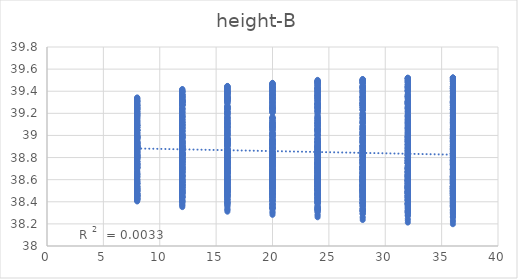
| Category | out:UTCI |
|---|---|
| 8.0 | 38.668 |
| 8.0 | 38.741 |
| 8.0 | 38.758 |
| 8.0 | 38.744 |
| 8.0 | 38.714 |
| 8.0 | 38.517 |
| 8.0 | 38.595 |
| 8.0 | 38.642 |
| 8.0 | 38.679 |
| 8.0 | 38.672 |
| 8.0 | 38.457 |
| 8.0 | 38.521 |
| 8.0 | 38.559 |
| 8.0 | 38.588 |
| 8.0 | 38.606 |
| 8.0 | 38.426 |
| 8.0 | 38.489 |
| 8.0 | 38.495 |
| 8.0 | 38.526 |
| 8.0 | 38.543 |
| 8.0 | 38.423 |
| 8.0 | 38.454 |
| 8.0 | 38.47 |
| 8.0 | 38.474 |
| 8.0 | 38.492 |
| 8.0 | 38.417 |
| 8.0 | 38.42 |
| 8.0 | 38.46 |
| 8.0 | 38.458 |
| 8.0 | 38.452 |
| 8.0 | 38.414 |
| 8.0 | 38.429 |
| 8.0 | 38.432 |
| 8.0 | 38.448 |
| 8.0 | 38.426 |
| 8.0 | 38.403 |
| 8.0 | 38.423 |
| 8.0 | 38.41 |
| 8.0 | 38.426 |
| 8.0 | 38.414 |
| 12.0 | 38.693 |
| 12.0 | 38.779 |
| 12.0 | 38.826 |
| 12.0 | 38.826 |
| 12.0 | 38.8 |
| 12.0 | 38.522 |
| 12.0 | 38.629 |
| 12.0 | 38.708 |
| 12.0 | 38.76 |
| 12.0 | 38.75 |
| 12.0 | 38.432 |
| 12.0 | 38.535 |
| 12.0 | 38.614 |
| 12.0 | 38.657 |
| 12.0 | 38.685 |
| 12.0 | 38.386 |
| 12.0 | 38.482 |
| 12.0 | 38.531 |
| 12.0 | 38.588 |
| 12.0 | 38.615 |
| 12.0 | 38.378 |
| 12.0 | 38.439 |
| 12.0 | 38.492 |
| 12.0 | 38.522 |
| 12.0 | 38.553 |
| 12.0 | 38.37 |
| 12.0 | 38.397 |
| 12.0 | 38.476 |
| 12.0 | 38.494 |
| 12.0 | 38.504 |
| 12.0 | 38.364 |
| 12.0 | 38.402 |
| 12.0 | 38.442 |
| 12.0 | 38.48 |
| 12.0 | 38.47 |
| 12.0 | 38.352 |
| 12.0 | 38.397 |
| 12.0 | 38.416 |
| 12.0 | 38.455 |
| 12.0 | 38.456 |
| 16.0 | 38.703 |
| 16.0 | 38.82 |
| 16.0 | 38.854 |
| 16.0 | 38.875 |
| 16.0 | 38.856 |
| 16.0 | 38.522 |
| 16.0 | 38.662 |
| 16.0 | 38.729 |
| 16.0 | 38.799 |
| 16.0 | 38.802 |
| 16.0 | 38.418 |
| 16.0 | 38.557 |
| 16.0 | 38.63 |
| 16.0 | 38.697 |
| 16.0 | 38.734 |
| 16.0 | 38.355 |
| 16.0 | 38.493 |
| 16.0 | 38.54 |
| 16.0 | 38.623 |
| 16.0 | 38.661 |
| 16.0 | 38.34 |
| 16.0 | 38.436 |
| 16.0 | 38.489 |
| 16.0 | 38.549 |
| 16.0 | 38.593 |
| 16.0 | 38.33 |
| 16.0 | 38.388 |
| 16.0 | 38.463 |
| 16.0 | 38.512 |
| 16.0 | 38.534 |
| 16.0 | 38.324 |
| 16.0 | 38.389 |
| 16.0 | 38.424 |
| 16.0 | 38.49 |
| 16.0 | 38.494 |
| 16.0 | 38.31 |
| 16.0 | 38.383 |
| 16.0 | 38.394 |
| 16.0 | 38.462 |
| 16.0 | 38.472 |
| 20.0 | 38.712 |
| 20.0 | 38.824 |
| 20.0 | 38.878 |
| 20.0 | 38.886 |
| 20.0 | 38.88 |
| 20.0 | 38.524 |
| 20.0 | 38.658 |
| 20.0 | 38.749 |
| 20.0 | 38.808 |
| 20.0 | 38.826 |
| 20.0 | 38.414 |
| 20.0 | 38.547 |
| 20.0 | 38.644 |
| 20.0 | 38.704 |
| 20.0 | 38.756 |
| 20.0 | 38.343 |
| 20.0 | 38.474 |
| 20.0 | 38.547 |
| 20.0 | 38.622 |
| 20.0 | 38.68 |
| 20.0 | 38.319 |
| 20.0 | 38.407 |
| 20.0 | 38.491 |
| 20.0 | 38.544 |
| 20.0 | 38.609 |
| 20.0 | 38.305 |
| 20.0 | 38.348 |
| 20.0 | 38.458 |
| 20.0 | 38.501 |
| 20.0 | 38.547 |
| 20.0 | 38.297 |
| 20.0 | 38.344 |
| 20.0 | 38.413 |
| 20.0 | 38.473 |
| 20.0 | 38.499 |
| 20.0 | 38.282 |
| 20.0 | 38.334 |
| 20.0 | 38.38 |
| 20.0 | 38.439 |
| 20.0 | 38.473 |
| 24.0 | 38.71 |
| 24.0 | 38.832 |
| 24.0 | 38.879 |
| 24.0 | 38.908 |
| 24.0 | 38.891 |
| 24.0 | 38.52 |
| 24.0 | 38.661 |
| 24.0 | 38.745 |
| 24.0 | 38.826 |
| 24.0 | 38.833 |
| 24.0 | 38.406 |
| 24.0 | 38.545 |
| 24.0 | 38.636 |
| 24.0 | 38.719 |
| 24.0 | 38.76 |
| 24.0 | 38.332 |
| 24.0 | 38.468 |
| 24.0 | 38.534 |
| 24.0 | 38.634 |
| 24.0 | 38.681 |
| 24.0 | 38.305 |
| 24.0 | 38.398 |
| 24.0 | 38.477 |
| 24.0 | 38.554 |
| 24.0 | 38.609 |
| 24.0 | 38.285 |
| 24.0 | 38.335 |
| 24.0 | 38.439 |
| 24.0 | 38.509 |
| 24.0 | 38.543 |
| 24.0 | 38.275 |
| 24.0 | 38.327 |
| 24.0 | 38.388 |
| 24.0 | 38.475 |
| 24.0 | 38.493 |
| 24.0 | 38.26 |
| 24.0 | 38.313 |
| 24.0 | 38.346 |
| 24.0 | 38.434 |
| 24.0 | 38.462 |
| 28.0 | 38.703 |
| 28.0 | 38.833 |
| 28.0 | 38.884 |
| 28.0 | 38.91 |
| 28.0 | 38.909 |
| 28.0 | 38.51 |
| 28.0 | 38.661 |
| 28.0 | 38.746 |
| 28.0 | 38.824 |
| 28.0 | 38.847 |
| 28.0 | 38.396 |
| 28.0 | 38.542 |
| 28.0 | 38.633 |
| 28.0 | 38.716 |
| 28.0 | 38.771 |
| 28.0 | 38.319 |
| 28.0 | 38.461 |
| 28.0 | 38.527 |
| 28.0 | 38.627 |
| 28.0 | 38.69 |
| 28.0 | 38.291 |
| 28.0 | 38.389 |
| 28.0 | 38.467 |
| 28.0 | 38.544 |
| 28.0 | 38.616 |
| 28.0 | 38.265 |
| 28.0 | 38.321 |
| 28.0 | 38.423 |
| 28.0 | 38.494 |
| 28.0 | 38.545 |
| 28.0 | 38.252 |
| 28.0 | 38.309 |
| 28.0 | 38.368 |
| 28.0 | 38.459 |
| 28.0 | 38.493 |
| 28.0 | 38.235 |
| 28.0 | 38.291 |
| 28.0 | 38.321 |
| 28.0 | 38.415 |
| 28.0 | 38.457 |
| 32.0 | 38.688 |
| 32.0 | 38.836 |
| 32.0 | 38.885 |
| 32.0 | 38.915 |
| 32.0 | 38.902 |
| 32.0 | 38.494 |
| 32.0 | 38.663 |
| 32.0 | 38.747 |
| 32.0 | 38.825 |
| 32.0 | 38.839 |
| 32.0 | 38.379 |
| 32.0 | 38.543 |
| 32.0 | 38.631 |
| 32.0 | 38.714 |
| 32.0 | 38.76 |
| 32.0 | 38.301 |
| 32.0 | 38.46 |
| 32.0 | 38.522 |
| 32.0 | 38.623 |
| 32.0 | 38.676 |
| 32.0 | 38.273 |
| 32.0 | 38.386 |
| 32.0 | 38.461 |
| 32.0 | 38.537 |
| 32.0 | 38.601 |
| 32.0 | 38.247 |
| 32.0 | 38.316 |
| 32.0 | 38.415 |
| 32.0 | 38.485 |
| 32.0 | 38.528 |
| 32.0 | 38.232 |
| 32.0 | 38.303 |
| 32.0 | 38.358 |
| 32.0 | 38.448 |
| 32.0 | 38.475 |
| 32.0 | 38.212 |
| 32.0 | 38.282 |
| 32.0 | 38.309 |
| 32.0 | 38.402 |
| 32.0 | 38.438 |
| 36.0 | 38.678 |
| 36.0 | 38.832 |
| 36.0 | 38.888 |
| 36.0 | 38.904 |
| 36.0 | 38.906 |
| 36.0 | 38.483 |
| 36.0 | 38.657 |
| 36.0 | 38.748 |
| 36.0 | 38.812 |
| 36.0 | 38.839 |
| 36.0 | 38.368 |
| 36.0 | 38.535 |
| 36.0 | 38.632 |
| 36.0 | 38.699 |
| 36.0 | 38.759 |
| 36.0 | 38.288 |
| 36.0 | 38.452 |
| 36.0 | 38.521 |
| 36.0 | 38.606 |
| 36.0 | 38.672 |
| 36.0 | 38.26 |
| 36.0 | 38.375 |
| 36.0 | 38.456 |
| 36.0 | 38.518 |
| 36.0 | 38.596 |
| 36.0 | 38.234 |
| 36.0 | 38.302 |
| 36.0 | 38.407 |
| 36.0 | 38.46 |
| 36.0 | 38.518 |
| 36.0 | 38.218 |
| 36.0 | 38.288 |
| 36.0 | 38.349 |
| 36.0 | 38.422 |
| 36.0 | 38.464 |
| 36.0 | 38.197 |
| 36.0 | 38.267 |
| 36.0 | 38.3 |
| 36.0 | 38.375 |
| 36.0 | 38.426 |
| 8.0 | 38.717 |
| 8.0 | 38.761 |
| 8.0 | 38.802 |
| 8.0 | 38.76 |
| 8.0 | 38.723 |
| 8.0 | 38.567 |
| 8.0 | 38.643 |
| 8.0 | 38.711 |
| 8.0 | 38.699 |
| 8.0 | 38.701 |
| 8.0 | 38.508 |
| 8.0 | 38.539 |
| 8.0 | 38.602 |
| 8.0 | 38.629 |
| 8.0 | 38.636 |
| 8.0 | 38.472 |
| 8.0 | 38.507 |
| 8.0 | 38.535 |
| 8.0 | 38.542 |
| 8.0 | 38.569 |
| 8.0 | 38.459 |
| 8.0 | 38.454 |
| 8.0 | 38.507 |
| 8.0 | 38.491 |
| 8.0 | 38.509 |
| 8.0 | 38.466 |
| 8.0 | 38.451 |
| 8.0 | 38.5 |
| 8.0 | 38.473 |
| 8.0 | 38.465 |
| 8.0 | 38.441 |
| 8.0 | 38.454 |
| 8.0 | 38.455 |
| 8.0 | 38.449 |
| 8.0 | 38.442 |
| 8.0 | 38.436 |
| 8.0 | 38.425 |
| 8.0 | 38.438 |
| 8.0 | 38.433 |
| 8.0 | 38.428 |
| 12.0 | 38.762 |
| 12.0 | 38.84 |
| 12.0 | 38.893 |
| 12.0 | 38.85 |
| 12.0 | 38.832 |
| 12.0 | 38.593 |
| 12.0 | 38.72 |
| 12.0 | 38.795 |
| 12.0 | 38.794 |
| 12.0 | 38.81 |
| 12.0 | 38.508 |
| 12.0 | 38.601 |
| 12.0 | 38.677 |
| 12.0 | 38.714 |
| 12.0 | 38.737 |
| 12.0 | 38.453 |
| 12.0 | 38.546 |
| 12.0 | 38.594 |
| 12.0 | 38.622 |
| 12.0 | 38.669 |
| 12.0 | 38.435 |
| 12.0 | 38.482 |
| 12.0 | 38.551 |
| 12.0 | 38.557 |
| 12.0 | 38.6 |
| 12.0 | 38.441 |
| 12.0 | 38.47 |
| 12.0 | 38.537 |
| 12.0 | 38.527 |
| 12.0 | 38.546 |
| 12.0 | 38.41 |
| 12.0 | 38.471 |
| 12.0 | 38.486 |
| 12.0 | 38.498 |
| 12.0 | 38.513 |
| 12.0 | 38.402 |
| 12.0 | 38.442 |
| 12.0 | 38.466 |
| 12.0 | 38.478 |
| 12.0 | 38.496 |
| 16.0 | 38.778 |
| 16.0 | 38.869 |
| 16.0 | 38.908 |
| 16.0 | 38.92 |
| 16.0 | 38.88 |
| 16.0 | 38.597 |
| 16.0 | 38.741 |
| 16.0 | 38.808 |
| 16.0 | 38.862 |
| 16.0 | 38.849 |
| 16.0 | 38.496 |
| 16.0 | 38.61 |
| 16.0 | 38.69 |
| 16.0 | 38.768 |
| 16.0 | 38.776 |
| 16.0 | 38.426 |
| 16.0 | 38.546 |
| 16.0 | 38.6 |
| 16.0 | 38.673 |
| 16.0 | 38.704 |
| 16.0 | 38.398 |
| 16.0 | 38.47 |
| 16.0 | 38.546 |
| 16.0 | 38.602 |
| 16.0 | 38.631 |
| 16.0 | 38.4 |
| 16.0 | 38.452 |
| 16.0 | 38.522 |
| 16.0 | 38.562 |
| 16.0 | 38.57 |
| 16.0 | 38.372 |
| 16.0 | 38.448 |
| 16.0 | 38.465 |
| 16.0 | 38.525 |
| 16.0 | 38.531 |
| 16.0 | 38.362 |
| 16.0 | 38.418 |
| 16.0 | 38.441 |
| 16.0 | 38.503 |
| 16.0 | 38.508 |
| 20.0 | 38.774 |
| 20.0 | 38.881 |
| 20.0 | 38.947 |
| 20.0 | 38.917 |
| 20.0 | 38.921 |
| 20.0 | 38.585 |
| 20.0 | 38.745 |
| 20.0 | 38.841 |
| 20.0 | 38.854 |
| 20.0 | 38.891 |
| 20.0 | 38.477 |
| 20.0 | 38.608 |
| 20.0 | 38.717 |
| 20.0 | 38.763 |
| 20.0 | 38.815 |
| 20.0 | 38.412 |
| 20.0 | 38.543 |
| 20.0 | 38.62 |
| 20.0 | 38.667 |
| 20.0 | 38.741 |
| 20.0 | 38.375 |
| 20.0 | 38.46 |
| 20.0 | 38.563 |
| 20.0 | 38.592 |
| 20.0 | 38.666 |
| 20.0 | 38.373 |
| 20.0 | 38.433 |
| 20.0 | 38.532 |
| 20.0 | 38.548 |
| 20.0 | 38.602 |
| 20.0 | 38.348 |
| 20.0 | 38.425 |
| 20.0 | 38.469 |
| 20.0 | 38.504 |
| 20.0 | 38.556 |
| 20.0 | 38.335 |
| 20.0 | 38.391 |
| 20.0 | 38.44 |
| 20.0 | 38.478 |
| 20.0 | 38.529 |
| 24.0 | 38.764 |
| 24.0 | 38.86 |
| 24.0 | 38.954 |
| 24.0 | 38.945 |
| 24.0 | 38.925 |
| 24.0 | 38.572 |
| 24.0 | 38.722 |
| 24.0 | 38.844 |
| 24.0 | 38.878 |
| 24.0 | 38.892 |
| 24.0 | 38.461 |
| 24.0 | 38.579 |
| 24.0 | 38.716 |
| 24.0 | 38.783 |
| 24.0 | 38.812 |
| 24.0 | 38.393 |
| 24.0 | 38.509 |
| 24.0 | 38.615 |
| 24.0 | 38.684 |
| 24.0 | 38.737 |
| 24.0 | 38.358 |
| 24.0 | 38.433 |
| 24.0 | 38.555 |
| 24.0 | 38.607 |
| 24.0 | 38.661 |
| 24.0 | 38.349 |
| 24.0 | 38.4 |
| 24.0 | 38.519 |
| 24.0 | 38.561 |
| 24.0 | 38.595 |
| 24.0 | 38.324 |
| 24.0 | 38.389 |
| 24.0 | 38.453 |
| 24.0 | 38.514 |
| 24.0 | 38.546 |
| 24.0 | 38.31 |
| 24.0 | 38.352 |
| 24.0 | 38.416 |
| 24.0 | 38.48 |
| 24.0 | 38.515 |
| 28.0 | 38.776 |
| 28.0 | 38.889 |
| 28.0 | 38.964 |
| 28.0 | 38.959 |
| 28.0 | 38.943 |
| 28.0 | 38.584 |
| 28.0 | 38.746 |
| 28.0 | 38.852 |
| 28.0 | 38.889 |
| 28.0 | 38.906 |
| 28.0 | 38.47 |
| 28.0 | 38.601 |
| 28.0 | 38.719 |
| 28.0 | 38.792 |
| 28.0 | 38.823 |
| 28.0 | 38.4 |
| 28.0 | 38.526 |
| 28.0 | 38.614 |
| 28.0 | 38.69 |
| 28.0 | 38.746 |
| 28.0 | 38.362 |
| 28.0 | 38.445 |
| 28.0 | 38.552 |
| 28.0 | 38.61 |
| 28.0 | 38.668 |
| 28.0 | 38.339 |
| 28.0 | 38.392 |
| 28.0 | 38.506 |
| 28.0 | 38.559 |
| 28.0 | 38.593 |
| 28.0 | 38.31 |
| 28.0 | 38.378 |
| 28.0 | 38.435 |
| 28.0 | 38.51 |
| 28.0 | 38.543 |
| 28.0 | 38.294 |
| 28.0 | 38.339 |
| 28.0 | 38.394 |
| 28.0 | 38.473 |
| 28.0 | 38.507 |
| 32.0 | 38.763 |
| 32.0 | 38.894 |
| 32.0 | 38.944 |
| 32.0 | 38.952 |
| 32.0 | 38.955 |
| 32.0 | 38.566 |
| 32.0 | 38.75 |
| 32.0 | 38.829 |
| 32.0 | 38.879 |
| 32.0 | 38.918 |
| 32.0 | 38.451 |
| 32.0 | 38.603 |
| 32.0 | 38.695 |
| 32.0 | 38.778 |
| 32.0 | 38.832 |
| 32.0 | 38.379 |
| 32.0 | 38.526 |
| 32.0 | 38.588 |
| 32.0 | 38.674 |
| 32.0 | 38.752 |
| 32.0 | 38.339 |
| 32.0 | 38.442 |
| 32.0 | 38.525 |
| 32.0 | 38.591 |
| 32.0 | 38.672 |
| 32.0 | 38.314 |
| 32.0 | 38.388 |
| 32.0 | 38.476 |
| 32.0 | 38.538 |
| 32.0 | 38.596 |
| 32.0 | 38.292 |
| 32.0 | 38.373 |
| 32.0 | 38.415 |
| 32.0 | 38.491 |
| 32.0 | 38.548 |
| 32.0 | 38.274 |
| 32.0 | 38.334 |
| 32.0 | 38.371 |
| 32.0 | 38.454 |
| 32.0 | 38.51 |
| 36.0 | 38.741 |
| 36.0 | 38.87 |
| 36.0 | 38.954 |
| 36.0 | 38.95 |
| 36.0 | 38.959 |
| 36.0 | 38.541 |
| 36.0 | 38.726 |
| 36.0 | 38.839 |
| 36.0 | 38.874 |
| 36.0 | 38.92 |
| 36.0 | 38.429 |
| 36.0 | 38.579 |
| 36.0 | 38.703 |
| 36.0 | 38.773 |
| 36.0 | 38.834 |
| 36.0 | 38.358 |
| 36.0 | 38.501 |
| 36.0 | 38.595 |
| 36.0 | 38.667 |
| 36.0 | 38.751 |
| 36.0 | 38.318 |
| 36.0 | 38.415 |
| 36.0 | 38.528 |
| 36.0 | 38.583 |
| 36.0 | 38.669 |
| 36.0 | 38.293 |
| 36.0 | 38.359 |
| 36.0 | 38.477 |
| 36.0 | 38.525 |
| 36.0 | 38.588 |
| 36.0 | 38.269 |
| 36.0 | 38.344 |
| 36.0 | 38.413 |
| 36.0 | 38.476 |
| 36.0 | 38.539 |
| 36.0 | 38.259 |
| 36.0 | 38.316 |
| 36.0 | 38.368 |
| 36.0 | 38.435 |
| 36.0 | 38.496 |
| 8.0 | 38.79 |
| 8.0 | 38.817 |
| 8.0 | 38.802 |
| 8.0 | 38.809 |
| 8.0 | 38.819 |
| 8.0 | 38.619 |
| 8.0 | 38.723 |
| 8.0 | 38.74 |
| 8.0 | 38.769 |
| 8.0 | 38.764 |
| 8.0 | 38.538 |
| 8.0 | 38.586 |
| 8.0 | 38.651 |
| 8.0 | 38.706 |
| 8.0 | 38.716 |
| 8.0 | 38.503 |
| 8.0 | 38.541 |
| 8.0 | 38.563 |
| 8.0 | 38.624 |
| 8.0 | 38.652 |
| 8.0 | 38.477 |
| 8.0 | 38.501 |
| 8.0 | 38.516 |
| 8.0 | 38.562 |
| 8.0 | 38.586 |
| 8.0 | 38.472 |
| 8.0 | 38.47 |
| 8.0 | 38.49 |
| 8.0 | 38.512 |
| 8.0 | 38.535 |
| 8.0 | 38.455 |
| 8.0 | 38.465 |
| 8.0 | 38.457 |
| 8.0 | 38.503 |
| 8.0 | 38.493 |
| 8.0 | 38.445 |
| 8.0 | 38.453 |
| 8.0 | 38.441 |
| 8.0 | 38.476 |
| 8.0 | 38.472 |
| 12.0 | 38.822 |
| 12.0 | 38.918 |
| 12.0 | 38.896 |
| 12.0 | 38.908 |
| 12.0 | 38.923 |
| 12.0 | 38.633 |
| 12.0 | 38.801 |
| 12.0 | 38.832 |
| 12.0 | 38.855 |
| 12.0 | 38.874 |
| 12.0 | 38.533 |
| 12.0 | 38.666 |
| 12.0 | 38.731 |
| 12.0 | 38.786 |
| 12.0 | 38.823 |
| 12.0 | 38.48 |
| 12.0 | 38.605 |
| 12.0 | 38.638 |
| 12.0 | 38.704 |
| 12.0 | 38.756 |
| 12.0 | 38.446 |
| 12.0 | 38.551 |
| 12.0 | 38.578 |
| 12.0 | 38.632 |
| 12.0 | 38.681 |
| 12.0 | 38.44 |
| 12.0 | 38.514 |
| 12.0 | 38.543 |
| 12.0 | 38.574 |
| 12.0 | 38.625 |
| 12.0 | 38.42 |
| 12.0 | 38.507 |
| 12.0 | 38.507 |
| 12.0 | 38.557 |
| 12.0 | 38.577 |
| 12.0 | 38.411 |
| 12.0 | 38.493 |
| 12.0 | 38.486 |
| 12.0 | 38.527 |
| 12.0 | 38.549 |
| 16.0 | 38.832 |
| 16.0 | 38.925 |
| 16.0 | 38.944 |
| 16.0 | 38.969 |
| 16.0 | 38.98 |
| 16.0 | 38.632 |
| 16.0 | 38.813 |
| 16.0 | 38.868 |
| 16.0 | 38.91 |
| 16.0 | 38.928 |
| 16.0 | 38.52 |
| 16.0 | 38.667 |
| 16.0 | 38.765 |
| 16.0 | 38.841 |
| 16.0 | 38.865 |
| 16.0 | 38.457 |
| 16.0 | 38.599 |
| 16.0 | 38.667 |
| 16.0 | 38.756 |
| 16.0 | 38.796 |
| 16.0 | 38.418 |
| 16.0 | 38.535 |
| 16.0 | 38.6 |
| 16.0 | 38.68 |
| 16.0 | 38.722 |
| 16.0 | 38.405 |
| 16.0 | 38.488 |
| 16.0 | 38.555 |
| 16.0 | 38.614 |
| 16.0 | 38.662 |
| 16.0 | 38.384 |
| 16.0 | 38.477 |
| 16.0 | 38.514 |
| 16.0 | 38.591 |
| 16.0 | 38.607 |
| 16.0 | 38.374 |
| 16.0 | 38.461 |
| 16.0 | 38.489 |
| 16.0 | 38.555 |
| 16.0 | 38.574 |
| 20.0 | 38.833 |
| 20.0 | 38.943 |
| 20.0 | 38.957 |
| 20.0 | 38.99 |
| 20.0 | 39.021 |
| 20.0 | 38.626 |
| 20.0 | 38.826 |
| 20.0 | 38.88 |
| 20.0 | 38.932 |
| 20.0 | 38.966 |
| 20.0 | 38.509 |
| 20.0 | 38.674 |
| 20.0 | 38.772 |
| 20.0 | 38.86 |
| 20.0 | 38.9 |
| 20.0 | 38.443 |
| 20.0 | 38.593 |
| 20.0 | 38.666 |
| 20.0 | 38.77 |
| 20.0 | 38.829 |
| 20.0 | 38.399 |
| 20.0 | 38.525 |
| 20.0 | 38.596 |
| 20.0 | 38.692 |
| 20.0 | 38.753 |
| 20.0 | 38.381 |
| 20.0 | 38.471 |
| 20.0 | 38.546 |
| 20.0 | 38.623 |
| 20.0 | 38.691 |
| 20.0 | 38.359 |
| 20.0 | 38.455 |
| 20.0 | 38.5 |
| 20.0 | 38.595 |
| 20.0 | 38.634 |
| 20.0 | 38.347 |
| 20.0 | 38.435 |
| 20.0 | 38.466 |
| 20.0 | 38.552 |
| 20.0 | 38.596 |
| 24.0 | 38.83 |
| 24.0 | 38.943 |
| 24.0 | 38.97 |
| 24.0 | 39 |
| 24.0 | 39.032 |
| 24.0 | 38.622 |
| 24.0 | 38.822 |
| 24.0 | 38.889 |
| 24.0 | 38.938 |
| 24.0 | 38.971 |
| 24.0 | 38.5 |
| 24.0 | 38.666 |
| 24.0 | 38.777 |
| 24.0 | 38.864 |
| 24.0 | 38.907 |
| 24.0 | 38.43 |
| 24.0 | 38.581 |
| 24.0 | 38.668 |
| 24.0 | 38.771 |
| 24.0 | 38.834 |
| 24.0 | 38.386 |
| 24.0 | 38.507 |
| 24.0 | 38.596 |
| 24.0 | 38.69 |
| 24.0 | 38.761 |
| 24.0 | 38.364 |
| 24.0 | 38.45 |
| 24.0 | 38.544 |
| 24.0 | 38.619 |
| 24.0 | 38.696 |
| 24.0 | 38.343 |
| 24.0 | 38.43 |
| 24.0 | 38.496 |
| 24.0 | 38.588 |
| 24.0 | 38.637 |
| 24.0 | 38.329 |
| 24.0 | 38.406 |
| 24.0 | 38.457 |
| 24.0 | 38.541 |
| 24.0 | 38.595 |
| 28.0 | 38.839 |
| 28.0 | 38.94 |
| 28.0 | 38.98 |
| 28.0 | 39.012 |
| 28.0 | 39.033 |
| 28.0 | 38.628 |
| 28.0 | 38.815 |
| 28.0 | 38.899 |
| 28.0 | 38.947 |
| 28.0 | 38.974 |
| 28.0 | 38.505 |
| 28.0 | 38.654 |
| 28.0 | 38.782 |
| 28.0 | 38.869 |
| 28.0 | 38.907 |
| 28.0 | 38.435 |
| 28.0 | 38.566 |
| 28.0 | 38.668 |
| 28.0 | 38.774 |
| 28.0 | 38.832 |
| 28.0 | 38.389 |
| 28.0 | 38.49 |
| 28.0 | 38.594 |
| 28.0 | 38.691 |
| 28.0 | 38.757 |
| 28.0 | 38.361 |
| 28.0 | 38.434 |
| 28.0 | 38.543 |
| 28.0 | 38.615 |
| 28.0 | 38.687 |
| 28.0 | 38.336 |
| 28.0 | 38.413 |
| 28.0 | 38.494 |
| 28.0 | 38.582 |
| 28.0 | 38.626 |
| 28.0 | 38.322 |
| 28.0 | 38.386 |
| 28.0 | 38.452 |
| 28.0 | 38.533 |
| 28.0 | 38.583 |
| 32.0 | 38.833 |
| 32.0 | 38.948 |
| 32.0 | 38.979 |
| 32.0 | 39.032 |
| 32.0 | 39.057 |
| 32.0 | 38.621 |
| 32.0 | 38.822 |
| 32.0 | 38.895 |
| 32.0 | 38.966 |
| 32.0 | 38.994 |
| 32.0 | 38.496 |
| 32.0 | 38.66 |
| 32.0 | 38.777 |
| 32.0 | 38.884 |
| 32.0 | 38.926 |
| 32.0 | 38.425 |
| 32.0 | 38.57 |
| 32.0 | 38.662 |
| 32.0 | 38.787 |
| 32.0 | 38.849 |
| 32.0 | 38.379 |
| 32.0 | 38.492 |
| 32.0 | 38.586 |
| 32.0 | 38.701 |
| 32.0 | 38.771 |
| 32.0 | 38.351 |
| 32.0 | 38.434 |
| 32.0 | 38.532 |
| 32.0 | 38.623 |
| 32.0 | 38.7 |
| 32.0 | 38.326 |
| 32.0 | 38.412 |
| 32.0 | 38.482 |
| 32.0 | 38.589 |
| 32.0 | 38.635 |
| 32.0 | 38.311 |
| 32.0 | 38.384 |
| 32.0 | 38.439 |
| 32.0 | 38.54 |
| 32.0 | 38.59 |
| 36.0 | 38.837 |
| 36.0 | 38.948 |
| 36.0 | 38.981 |
| 36.0 | 39.031 |
| 36.0 | 39.053 |
| 36.0 | 38.628 |
| 36.0 | 38.822 |
| 36.0 | 38.897 |
| 36.0 | 38.963 |
| 36.0 | 38.99 |
| 36.0 | 38.499 |
| 36.0 | 38.659 |
| 36.0 | 38.776 |
| 36.0 | 38.88 |
| 36.0 | 38.92 |
| 36.0 | 38.426 |
| 36.0 | 38.566 |
| 36.0 | 38.658 |
| 36.0 | 38.781 |
| 36.0 | 38.843 |
| 36.0 | 38.38 |
| 36.0 | 38.486 |
| 36.0 | 38.578 |
| 36.0 | 38.69 |
| 36.0 | 38.76 |
| 36.0 | 38.351 |
| 36.0 | 38.427 |
| 36.0 | 38.523 |
| 36.0 | 38.61 |
| 36.0 | 38.688 |
| 36.0 | 38.325 |
| 36.0 | 38.404 |
| 36.0 | 38.471 |
| 36.0 | 38.576 |
| 36.0 | 38.622 |
| 36.0 | 38.305 |
| 36.0 | 38.369 |
| 36.0 | 38.417 |
| 36.0 | 38.526 |
| 36.0 | 38.58 |
| 8.0 | 38.891 |
| 8.0 | 38.894 |
| 8.0 | 38.962 |
| 8.0 | 38.928 |
| 8.0 | 38.893 |
| 8.0 | 38.713 |
| 8.0 | 38.833 |
| 8.0 | 38.901 |
| 8.0 | 38.871 |
| 8.0 | 38.873 |
| 8.0 | 38.625 |
| 8.0 | 38.708 |
| 8.0 | 38.813 |
| 8.0 | 38.824 |
| 8.0 | 38.81 |
| 8.0 | 38.565 |
| 8.0 | 38.628 |
| 8.0 | 38.734 |
| 8.0 | 38.752 |
| 8.0 | 38.771 |
| 8.0 | 38.521 |
| 8.0 | 38.578 |
| 8.0 | 38.653 |
| 8.0 | 38.689 |
| 8.0 | 38.724 |
| 8.0 | 38.518 |
| 8.0 | 38.534 |
| 8.0 | 38.615 |
| 8.0 | 38.633 |
| 8.0 | 38.649 |
| 8.0 | 38.51 |
| 8.0 | 38.523 |
| 8.0 | 38.578 |
| 8.0 | 38.575 |
| 8.0 | 38.601 |
| 8.0 | 38.479 |
| 8.0 | 38.5 |
| 8.0 | 38.528 |
| 8.0 | 38.567 |
| 8.0 | 38.561 |
| 12.0 | 38.921 |
| 12.0 | 39.003 |
| 12.0 | 39.055 |
| 12.0 | 39.036 |
| 12.0 | 39.028 |
| 12.0 | 38.734 |
| 12.0 | 38.923 |
| 12.0 | 38.988 |
| 12.0 | 38.979 |
| 12.0 | 38.99 |
| 12.0 | 38.634 |
| 12.0 | 38.791 |
| 12.0 | 38.892 |
| 12.0 | 38.931 |
| 12.0 | 38.925 |
| 12.0 | 38.556 |
| 12.0 | 38.706 |
| 12.0 | 38.81 |
| 12.0 | 38.856 |
| 12.0 | 38.884 |
| 12.0 | 38.507 |
| 12.0 | 38.644 |
| 12.0 | 38.725 |
| 12.0 | 38.788 |
| 12.0 | 38.832 |
| 12.0 | 38.5 |
| 12.0 | 38.593 |
| 12.0 | 38.68 |
| 12.0 | 38.726 |
| 12.0 | 38.757 |
| 12.0 | 38.487 |
| 12.0 | 38.577 |
| 12.0 | 38.635 |
| 12.0 | 38.662 |
| 12.0 | 38.704 |
| 12.0 | 38.453 |
| 12.0 | 38.553 |
| 12.0 | 38.584 |
| 12.0 | 38.647 |
| 12.0 | 38.659 |
| 16.0 | 38.963 |
| 16.0 | 39.019 |
| 16.0 | 39.096 |
| 16.0 | 39.098 |
| 16.0 | 39.072 |
| 16.0 | 38.767 |
| 16.0 | 38.932 |
| 16.0 | 39.019 |
| 16.0 | 39.036 |
| 16.0 | 39.031 |
| 16.0 | 38.655 |
| 16.0 | 38.798 |
| 16.0 | 38.922 |
| 16.0 | 38.989 |
| 16.0 | 38.978 |
| 16.0 | 38.563 |
| 16.0 | 38.708 |
| 16.0 | 38.836 |
| 16.0 | 38.909 |
| 16.0 | 38.934 |
| 16.0 | 38.51 |
| 16.0 | 38.641 |
| 16.0 | 38.748 |
| 16.0 | 38.836 |
| 16.0 | 38.882 |
| 16.0 | 38.499 |
| 16.0 | 38.58 |
| 16.0 | 38.699 |
| 16.0 | 38.775 |
| 16.0 | 38.807 |
| 16.0 | 38.478 |
| 16.0 | 38.561 |
| 16.0 | 38.647 |
| 16.0 | 38.708 |
| 16.0 | 38.752 |
| 16.0 | 38.447 |
| 16.0 | 38.535 |
| 16.0 | 38.593 |
| 16.0 | 38.687 |
| 16.0 | 38.702 |
| 20.0 | 38.962 |
| 20.0 | 39.047 |
| 20.0 | 39.13 |
| 20.0 | 39.127 |
| 20.0 | 39.121 |
| 20.0 | 38.76 |
| 20.0 | 38.959 |
| 20.0 | 39.049 |
| 20.0 | 39.061 |
| 20.0 | 39.077 |
| 20.0 | 38.643 |
| 20.0 | 38.821 |
| 20.0 | 38.947 |
| 20.0 | 39.011 |
| 20.0 | 39.022 |
| 20.0 | 38.542 |
| 20.0 | 38.722 |
| 20.0 | 38.857 |
| 20.0 | 38.92 |
| 20.0 | 38.976 |
| 20.0 | 38.491 |
| 20.0 | 38.653 |
| 20.0 | 38.767 |
| 20.0 | 38.848 |
| 20.0 | 38.92 |
| 20.0 | 38.473 |
| 20.0 | 38.587 |
| 20.0 | 38.716 |
| 20.0 | 38.786 |
| 20.0 | 38.845 |
| 20.0 | 38.448 |
| 20.0 | 38.562 |
| 20.0 | 38.66 |
| 20.0 | 38.717 |
| 20.0 | 38.79 |
| 20.0 | 38.42 |
| 20.0 | 38.533 |
| 20.0 | 38.603 |
| 20.0 | 38.693 |
| 20.0 | 38.736 |
| 24.0 | 38.937 |
| 24.0 | 39.056 |
| 24.0 | 39.126 |
| 24.0 | 39.156 |
| 24.0 | 39.153 |
| 24.0 | 38.733 |
| 24.0 | 38.964 |
| 24.0 | 39.047 |
| 24.0 | 39.086 |
| 24.0 | 39.107 |
| 24.0 | 38.613 |
| 24.0 | 38.822 |
| 24.0 | 38.941 |
| 24.0 | 39.034 |
| 24.0 | 39.05 |
| 24.0 | 38.509 |
| 24.0 | 38.721 |
| 24.0 | 38.848 |
| 24.0 | 38.94 |
| 24.0 | 39.003 |
| 24.0 | 38.465 |
| 24.0 | 38.644 |
| 24.0 | 38.755 |
| 24.0 | 38.867 |
| 24.0 | 38.934 |
| 24.0 | 38.443 |
| 24.0 | 38.573 |
| 24.0 | 38.705 |
| 24.0 | 38.802 |
| 24.0 | 38.858 |
| 24.0 | 38.418 |
| 24.0 | 38.548 |
| 24.0 | 38.645 |
| 24.0 | 38.733 |
| 24.0 | 38.802 |
| 24.0 | 38.388 |
| 24.0 | 38.517 |
| 24.0 | 38.59 |
| 24.0 | 38.706 |
| 24.0 | 38.747 |
| 28.0 | 38.958 |
| 28.0 | 39.056 |
| 28.0 | 39.155 |
| 28.0 | 39.159 |
| 28.0 | 39.169 |
| 28.0 | 38.756 |
| 28.0 | 38.963 |
| 28.0 | 39.072 |
| 28.0 | 39.088 |
| 28.0 | 39.121 |
| 28.0 | 38.634 |
| 28.0 | 38.818 |
| 28.0 | 38.964 |
| 28.0 | 39.032 |
| 28.0 | 39.061 |
| 28.0 | 38.527 |
| 28.0 | 38.715 |
| 28.0 | 38.87 |
| 28.0 | 38.941 |
| 28.0 | 39.011 |
| 28.0 | 38.478 |
| 28.0 | 38.635 |
| 28.0 | 38.776 |
| 28.0 | 38.865 |
| 28.0 | 38.939 |
| 28.0 | 38.444 |
| 28.0 | 38.567 |
| 28.0 | 38.716 |
| 28.0 | 38.795 |
| 28.0 | 38.865 |
| 28.0 | 38.415 |
| 28.0 | 38.536 |
| 28.0 | 38.655 |
| 28.0 | 38.725 |
| 28.0 | 38.808 |
| 28.0 | 38.384 |
| 28.0 | 38.503 |
| 28.0 | 38.597 |
| 28.0 | 38.697 |
| 28.0 | 38.751 |
| 32.0 | 38.959 |
| 32.0 | 39.064 |
| 32.0 | 39.152 |
| 32.0 | 39.167 |
| 32.0 | 39.169 |
| 32.0 | 38.752 |
| 32.0 | 38.969 |
| 32.0 | 39.068 |
| 32.0 | 39.095 |
| 32.0 | 39.12 |
| 32.0 | 38.63 |
| 32.0 | 38.822 |
| 32.0 | 38.958 |
| 32.0 | 39.038 |
| 32.0 | 39.058 |
| 32.0 | 38.525 |
| 32.0 | 38.717 |
| 32.0 | 38.861 |
| 32.0 | 38.945 |
| 32.0 | 39.007 |
| 32.0 | 38.475 |
| 32.0 | 38.635 |
| 32.0 | 38.765 |
| 32.0 | 38.869 |
| 32.0 | 38.935 |
| 32.0 | 38.444 |
| 32.0 | 38.564 |
| 32.0 | 38.703 |
| 32.0 | 38.798 |
| 32.0 | 38.86 |
| 32.0 | 38.412 |
| 32.0 | 38.528 |
| 32.0 | 38.644 |
| 32.0 | 38.724 |
| 32.0 | 38.808 |
| 32.0 | 38.38 |
| 32.0 | 38.493 |
| 32.0 | 38.586 |
| 32.0 | 38.694 |
| 32.0 | 38.75 |
| 36.0 | 38.956 |
| 36.0 | 39.045 |
| 36.0 | 39.142 |
| 36.0 | 39.182 |
| 36.0 | 39.176 |
| 36.0 | 38.748 |
| 36.0 | 38.948 |
| 36.0 | 39.055 |
| 36.0 | 39.11 |
| 36.0 | 39.125 |
| 36.0 | 38.627 |
| 36.0 | 38.8 |
| 36.0 | 38.945 |
| 36.0 | 39.052 |
| 36.0 | 39.062 |
| 36.0 | 38.521 |
| 36.0 | 38.694 |
| 36.0 | 38.85 |
| 36.0 | 38.959 |
| 36.0 | 39.009 |
| 36.0 | 38.473 |
| 36.0 | 38.61 |
| 36.0 | 38.753 |
| 36.0 | 38.882 |
| 36.0 | 38.934 |
| 36.0 | 38.439 |
| 36.0 | 38.539 |
| 36.0 | 38.692 |
| 36.0 | 38.809 |
| 36.0 | 38.858 |
| 36.0 | 38.408 |
| 36.0 | 38.501 |
| 36.0 | 38.63 |
| 36.0 | 38.735 |
| 36.0 | 38.803 |
| 36.0 | 38.386 |
| 36.0 | 38.467 |
| 36.0 | 38.582 |
| 36.0 | 38.696 |
| 36.0 | 38.739 |
| 8.0 | 39.05 |
| 8.0 | 39.087 |
| 8.0 | 39.101 |
| 8.0 | 39.045 |
| 8.0 | 38.994 |
| 8.0 | 38.886 |
| 8.0 | 39.009 |
| 8.0 | 39.091 |
| 8.0 | 39.048 |
| 8.0 | 39.019 |
| 8.0 | 38.744 |
| 8.0 | 38.904 |
| 8.0 | 39.009 |
| 8.0 | 39.019 |
| 8.0 | 39.022 |
| 8.0 | 38.655 |
| 8.0 | 38.789 |
| 8.0 | 38.932 |
| 8.0 | 38.976 |
| 8.0 | 38.992 |
| 8.0 | 38.596 |
| 8.0 | 38.71 |
| 8.0 | 38.851 |
| 8.0 | 38.918 |
| 8.0 | 38.94 |
| 8.0 | 38.57 |
| 8.0 | 38.645 |
| 8.0 | 38.764 |
| 8.0 | 38.853 |
| 8.0 | 38.884 |
| 8.0 | 38.551 |
| 8.0 | 38.584 |
| 8.0 | 38.711 |
| 8.0 | 38.788 |
| 8.0 | 38.841 |
| 8.0 | 38.527 |
| 8.0 | 38.563 |
| 8.0 | 38.664 |
| 8.0 | 38.724 |
| 8.0 | 38.796 |
| 12.0 | 39.098 |
| 12.0 | 39.161 |
| 12.0 | 39.193 |
| 12.0 | 39.147 |
| 12.0 | 39.104 |
| 12.0 | 38.923 |
| 12.0 | 39.074 |
| 12.0 | 39.177 |
| 12.0 | 39.153 |
| 12.0 | 39.127 |
| 12.0 | 38.775 |
| 12.0 | 38.96 |
| 12.0 | 39.092 |
| 12.0 | 39.12 |
| 12.0 | 39.126 |
| 12.0 | 38.677 |
| 12.0 | 38.843 |
| 12.0 | 39.009 |
| 12.0 | 39.074 |
| 12.0 | 39.095 |
| 12.0 | 38.612 |
| 12.0 | 38.764 |
| 12.0 | 38.93 |
| 12.0 | 39.014 |
| 12.0 | 39.042 |
| 12.0 | 38.579 |
| 12.0 | 38.69 |
| 12.0 | 38.842 |
| 12.0 | 38.948 |
| 12.0 | 38.985 |
| 12.0 | 38.561 |
| 12.0 | 38.628 |
| 12.0 | 38.785 |
| 12.0 | 38.883 |
| 12.0 | 38.941 |
| 12.0 | 38.534 |
| 12.0 | 38.603 |
| 12.0 | 38.735 |
| 12.0 | 38.817 |
| 12.0 | 38.896 |
| 16.0 | 39.095 |
| 16.0 | 39.215 |
| 16.0 | 39.242 |
| 16.0 | 39.21 |
| 16.0 | 39.181 |
| 16.0 | 38.916 |
| 16.0 | 39.122 |
| 16.0 | 39.221 |
| 16.0 | 39.212 |
| 16.0 | 39.202 |
| 16.0 | 38.761 |
| 16.0 | 39.002 |
| 16.0 | 39.131 |
| 16.0 | 39.176 |
| 16.0 | 39.198 |
| 16.0 | 38.658 |
| 16.0 | 38.881 |
| 16.0 | 39.049 |
| 16.0 | 39.128 |
| 16.0 | 39.165 |
| 16.0 | 38.589 |
| 16.0 | 38.8 |
| 16.0 | 38.967 |
| 16.0 | 39.066 |
| 16.0 | 39.111 |
| 16.0 | 38.553 |
| 16.0 | 38.725 |
| 16.0 | 38.881 |
| 16.0 | 39 |
| 16.0 | 39.053 |
| 16.0 | 38.53 |
| 16.0 | 38.66 |
| 16.0 | 38.821 |
| 16.0 | 38.934 |
| 16.0 | 39.008 |
| 16.0 | 38.502 |
| 16.0 | 38.629 |
| 16.0 | 38.767 |
| 16.0 | 38.865 |
| 16.0 | 38.963 |
| 20.0 | 39.108 |
| 20.0 | 39.216 |
| 20.0 | 39.274 |
| 20.0 | 39.253 |
| 20.0 | 39.23 |
| 20.0 | 38.921 |
| 20.0 | 39.114 |
| 20.0 | 39.249 |
| 20.0 | 39.254 |
| 20.0 | 39.25 |
| 20.0 | 38.761 |
| 20.0 | 38.995 |
| 20.0 | 39.157 |
| 20.0 | 39.218 |
| 20.0 | 39.243 |
| 20.0 | 38.654 |
| 20.0 | 38.884 |
| 20.0 | 39.071 |
| 20.0 | 39.156 |
| 20.0 | 39.208 |
| 20.0 | 38.58 |
| 20.0 | 38.8 |
| 20.0 | 38.987 |
| 20.0 | 39.093 |
| 20.0 | 39.152 |
| 20.0 | 38.543 |
| 20.0 | 38.723 |
| 20.0 | 38.897 |
| 20.0 | 39.021 |
| 20.0 | 39.094 |
| 20.0 | 38.516 |
| 20.0 | 38.658 |
| 20.0 | 38.838 |
| 20.0 | 38.954 |
| 20.0 | 39.047 |
| 20.0 | 38.485 |
| 20.0 | 38.624 |
| 20.0 | 38.784 |
| 20.0 | 38.888 |
| 20.0 | 39.001 |
| 24.0 | 39.113 |
| 24.0 | 39.23 |
| 24.0 | 39.283 |
| 24.0 | 39.282 |
| 24.0 | 39.255 |
| 24.0 | 38.925 |
| 24.0 | 39.126 |
| 24.0 | 39.255 |
| 24.0 | 39.281 |
| 24.0 | 39.272 |
| 24.0 | 38.761 |
| 24.0 | 39.004 |
| 24.0 | 39.16 |
| 24.0 | 39.243 |
| 24.0 | 39.263 |
| 24.0 | 38.65 |
| 24.0 | 38.889 |
| 24.0 | 39.072 |
| 24.0 | 39.175 |
| 24.0 | 39.225 |
| 24.0 | 38.569 |
| 24.0 | 38.788 |
| 24.0 | 38.986 |
| 24.0 | 39.109 |
| 24.0 | 39.171 |
| 24.0 | 38.532 |
| 24.0 | 38.709 |
| 24.0 | 38.895 |
| 24.0 | 39.04 |
| 24.0 | 39.111 |
| 24.0 | 38.504 |
| 24.0 | 38.644 |
| 24.0 | 38.836 |
| 24.0 | 38.973 |
| 24.0 | 39.063 |
| 24.0 | 38.471 |
| 24.0 | 38.608 |
| 24.0 | 38.78 |
| 24.0 | 38.906 |
| 24.0 | 39.017 |
| 28.0 | 39.111 |
| 28.0 | 39.228 |
| 28.0 | 39.291 |
| 28.0 | 39.293 |
| 28.0 | 39.273 |
| 28.0 | 38.923 |
| 28.0 | 39.127 |
| 28.0 | 39.253 |
| 28.0 | 39.291 |
| 28.0 | 39.286 |
| 28.0 | 38.756 |
| 28.0 | 39 |
| 28.0 | 39.158 |
| 28.0 | 39.25 |
| 28.0 | 39.274 |
| 28.0 | 38.641 |
| 28.0 | 38.882 |
| 28.0 | 39.067 |
| 28.0 | 39.181 |
| 28.0 | 39.234 |
| 28.0 | 38.559 |
| 28.0 | 38.779 |
| 28.0 | 38.979 |
| 28.0 | 39.114 |
| 28.0 | 39.178 |
| 28.0 | 38.521 |
| 28.0 | 38.698 |
| 28.0 | 38.902 |
| 28.0 | 39.043 |
| 28.0 | 39.125 |
| 28.0 | 38.493 |
| 28.0 | 38.631 |
| 28.0 | 38.839 |
| 28.0 | 38.975 |
| 28.0 | 39.075 |
| 28.0 | 38.459 |
| 28.0 | 38.593 |
| 28.0 | 38.782 |
| 28.0 | 38.907 |
| 28.0 | 39.028 |
| 32.0 | 39.105 |
| 32.0 | 39.217 |
| 32.0 | 39.289 |
| 32.0 | 39.304 |
| 32.0 | 39.282 |
| 32.0 | 38.916 |
| 32.0 | 39.114 |
| 32.0 | 39.255 |
| 32.0 | 39.298 |
| 32.0 | 39.298 |
| 32.0 | 38.751 |
| 32.0 | 38.991 |
| 32.0 | 39.158 |
| 32.0 | 39.255 |
| 32.0 | 39.287 |
| 32.0 | 38.636 |
| 32.0 | 38.874 |
| 32.0 | 39.067 |
| 32.0 | 39.184 |
| 32.0 | 39.247 |
| 32.0 | 38.554 |
| 32.0 | 38.771 |
| 32.0 | 38.977 |
| 32.0 | 39.116 |
| 32.0 | 39.191 |
| 32.0 | 38.515 |
| 32.0 | 38.688 |
| 32.0 | 38.901 |
| 32.0 | 39.044 |
| 32.0 | 39.137 |
| 32.0 | 38.481 |
| 32.0 | 38.63 |
| 32.0 | 38.823 |
| 32.0 | 38.983 |
| 32.0 | 39.076 |
| 32.0 | 38.447 |
| 32.0 | 38.59 |
| 32.0 | 38.766 |
| 32.0 | 38.915 |
| 32.0 | 39.023 |
| 36.0 | 39.096 |
| 36.0 | 39.232 |
| 36.0 | 39.289 |
| 36.0 | 39.302 |
| 36.0 | 39.295 |
| 36.0 | 38.904 |
| 36.0 | 39.129 |
| 36.0 | 39.255 |
| 36.0 | 39.294 |
| 36.0 | 39.31 |
| 36.0 | 38.736 |
| 36.0 | 39.004 |
| 36.0 | 39.156 |
| 36.0 | 39.25 |
| 36.0 | 39.297 |
| 36.0 | 38.62 |
| 36.0 | 38.884 |
| 36.0 | 39.065 |
| 36.0 | 39.178 |
| 36.0 | 39.256 |
| 36.0 | 38.536 |
| 36.0 | 38.78 |
| 36.0 | 38.973 |
| 36.0 | 39.107 |
| 36.0 | 39.197 |
| 36.0 | 38.496 |
| 36.0 | 38.695 |
| 36.0 | 38.897 |
| 36.0 | 39.034 |
| 36.0 | 39.143 |
| 36.0 | 38.461 |
| 36.0 | 38.635 |
| 36.0 | 38.817 |
| 36.0 | 38.971 |
| 36.0 | 39.077 |
| 36.0 | 38.427 |
| 36.0 | 38.582 |
| 36.0 | 38.759 |
| 36.0 | 38.903 |
| 36.0 | 39.023 |
| 8.0 | 39.307 |
| 8.0 | 39.181 |
| 8.0 | 39.176 |
| 8.0 | 39.073 |
| 8.0 | 38.992 |
| 8.0 | 39.27 |
| 8.0 | 39.233 |
| 8.0 | 39.244 |
| 8.0 | 39.151 |
| 8.0 | 39.098 |
| 8.0 | 39.197 |
| 8.0 | 39.211 |
| 8.0 | 39.248 |
| 8.0 | 39.198 |
| 8.0 | 39.132 |
| 8.0 | 39.109 |
| 8.0 | 39.183 |
| 8.0 | 39.242 |
| 8.0 | 39.195 |
| 8.0 | 39.162 |
| 8.0 | 38.981 |
| 8.0 | 39.108 |
| 8.0 | 39.204 |
| 8.0 | 39.191 |
| 8.0 | 39.167 |
| 8.0 | 38.887 |
| 8.0 | 39.048 |
| 8.0 | 39.178 |
| 8.0 | 39.166 |
| 8.0 | 39.151 |
| 8.0 | 38.801 |
| 8.0 | 38.992 |
| 8.0 | 39.117 |
| 8.0 | 39.127 |
| 8.0 | 39.131 |
| 8.0 | 38.742 |
| 8.0 | 38.911 |
| 8.0 | 39.089 |
| 8.0 | 39.093 |
| 8.0 | 39.113 |
| 12.0 | 39.362 |
| 12.0 | 39.321 |
| 12.0 | 39.287 |
| 12.0 | 39.23 |
| 12.0 | 39.175 |
| 12.0 | 39.314 |
| 12.0 | 39.37 |
| 12.0 | 39.349 |
| 12.0 | 39.31 |
| 12.0 | 39.271 |
| 12.0 | 39.236 |
| 12.0 | 39.342 |
| 12.0 | 39.35 |
| 12.0 | 39.351 |
| 12.0 | 39.301 |
| 12.0 | 39.143 |
| 12.0 | 39.309 |
| 12.0 | 39.342 |
| 12.0 | 39.346 |
| 12.0 | 39.33 |
| 12.0 | 39.014 |
| 12.0 | 39.237 |
| 12.0 | 39.304 |
| 12.0 | 39.343 |
| 12.0 | 39.335 |
| 12.0 | 38.929 |
| 12.0 | 39.171 |
| 12.0 | 39.277 |
| 12.0 | 39.317 |
| 12.0 | 39.317 |
| 12.0 | 38.83 |
| 12.0 | 39.117 |
| 12.0 | 39.213 |
| 12.0 | 39.276 |
| 12.0 | 39.297 |
| 12.0 | 38.765 |
| 12.0 | 39.038 |
| 12.0 | 39.188 |
| 12.0 | 39.242 |
| 12.0 | 39.279 |
| 16.0 | 39.381 |
| 16.0 | 39.36 |
| 16.0 | 39.344 |
| 16.0 | 39.318 |
| 16.0 | 39.24 |
| 16.0 | 39.328 |
| 16.0 | 39.409 |
| 16.0 | 39.403 |
| 16.0 | 39.393 |
| 16.0 | 39.333 |
| 16.0 | 39.239 |
| 16.0 | 39.374 |
| 16.0 | 39.399 |
| 16.0 | 39.429 |
| 16.0 | 39.37 |
| 16.0 | 39.134 |
| 16.0 | 39.335 |
| 16.0 | 39.388 |
| 16.0 | 39.421 |
| 16.0 | 39.397 |
| 16.0 | 39.006 |
| 16.0 | 39.259 |
| 16.0 | 39.347 |
| 16.0 | 39.414 |
| 16.0 | 39.401 |
| 16.0 | 38.928 |
| 16.0 | 39.195 |
| 16.0 | 39.32 |
| 16.0 | 39.386 |
| 16.0 | 39.382 |
| 16.0 | 38.817 |
| 16.0 | 39.14 |
| 16.0 | 39.255 |
| 16.0 | 39.344 |
| 16.0 | 39.361 |
| 16.0 | 38.763 |
| 16.0 | 39.061 |
| 16.0 | 39.229 |
| 16.0 | 39.31 |
| 16.0 | 39.343 |
| 20.0 | 39.375 |
| 20.0 | 39.393 |
| 20.0 | 39.381 |
| 20.0 | 39.357 |
| 20.0 | 39.302 |
| 20.0 | 39.326 |
| 20.0 | 39.438 |
| 20.0 | 39.437 |
| 20.0 | 39.43 |
| 20.0 | 39.394 |
| 20.0 | 39.24 |
| 20.0 | 39.401 |
| 20.0 | 39.43 |
| 20.0 | 39.464 |
| 20.0 | 39.428 |
| 20.0 | 39.134 |
| 20.0 | 39.356 |
| 20.0 | 39.415 |
| 20.0 | 39.45 |
| 20.0 | 39.453 |
| 20.0 | 39.006 |
| 20.0 | 39.281 |
| 20.0 | 39.373 |
| 20.0 | 39.441 |
| 20.0 | 39.456 |
| 20.0 | 38.925 |
| 20.0 | 39.216 |
| 20.0 | 39.344 |
| 20.0 | 39.412 |
| 20.0 | 39.436 |
| 20.0 | 38.81 |
| 20.0 | 39.159 |
| 20.0 | 39.278 |
| 20.0 | 39.369 |
| 20.0 | 39.414 |
| 20.0 | 38.76 |
| 20.0 | 39.08 |
| 20.0 | 39.25 |
| 20.0 | 39.334 |
| 20.0 | 39.396 |
| 24.0 | 39.365 |
| 24.0 | 39.387 |
| 24.0 | 39.398 |
| 24.0 | 39.402 |
| 24.0 | 39.331 |
| 24.0 | 39.31 |
| 24.0 | 39.427 |
| 24.0 | 39.454 |
| 24.0 | 39.47 |
| 24.0 | 39.423 |
| 24.0 | 39.22 |
| 24.0 | 39.385 |
| 24.0 | 39.444 |
| 24.0 | 39.503 |
| 24.0 | 39.457 |
| 24.0 | 39.113 |
| 24.0 | 39.337 |
| 24.0 | 39.428 |
| 24.0 | 39.486 |
| 24.0 | 39.48 |
| 24.0 | 39.001 |
| 24.0 | 39.264 |
| 24.0 | 39.384 |
| 24.0 | 39.475 |
| 24.0 | 39.472 |
| 24.0 | 38.916 |
| 24.0 | 39.197 |
| 24.0 | 39.354 |
| 24.0 | 39.446 |
| 24.0 | 39.45 |
| 24.0 | 38.802 |
| 24.0 | 39.138 |
| 24.0 | 39.288 |
| 24.0 | 39.401 |
| 24.0 | 39.428 |
| 24.0 | 38.749 |
| 24.0 | 39.06 |
| 24.0 | 39.259 |
| 24.0 | 39.365 |
| 24.0 | 39.409 |
| 28.0 | 39.382 |
| 28.0 | 39.394 |
| 28.0 | 39.43 |
| 28.0 | 39.411 |
| 28.0 | 39.352 |
| 28.0 | 39.324 |
| 28.0 | 39.435 |
| 28.0 | 39.485 |
| 28.0 | 39.479 |
| 28.0 | 39.442 |
| 28.0 | 39.23 |
| 28.0 | 39.391 |
| 28.0 | 39.474 |
| 28.0 | 39.51 |
| 28.0 | 39.475 |
| 28.0 | 39.12 |
| 28.0 | 39.342 |
| 28.0 | 39.457 |
| 28.0 | 39.493 |
| 28.0 | 39.498 |
| 28.0 | 39.009 |
| 28.0 | 39.268 |
| 28.0 | 39.411 |
| 28.0 | 39.48 |
| 28.0 | 39.488 |
| 28.0 | 38.9 |
| 28.0 | 39.2 |
| 28.0 | 39.368 |
| 28.0 | 39.449 |
| 28.0 | 39.47 |
| 28.0 | 38.784 |
| 28.0 | 39.14 |
| 28.0 | 39.3 |
| 28.0 | 39.403 |
| 28.0 | 39.447 |
| 28.0 | 38.732 |
| 28.0 | 39.062 |
| 28.0 | 39.27 |
| 28.0 | 39.367 |
| 28.0 | 39.427 |
| 32.0 | 39.359 |
| 32.0 | 39.403 |
| 32.0 | 39.422 |
| 32.0 | 39.413 |
| 32.0 | 39.366 |
| 32.0 | 39.306 |
| 32.0 | 39.446 |
| 32.0 | 39.475 |
| 32.0 | 39.48 |
| 32.0 | 39.456 |
| 32.0 | 39.22 |
| 32.0 | 39.404 |
| 32.0 | 39.463 |
| 32.0 | 39.512 |
| 32.0 | 39.487 |
| 32.0 | 39.106 |
| 32.0 | 39.356 |
| 32.0 | 39.447 |
| 32.0 | 39.494 |
| 32.0 | 39.509 |
| 32.0 | 38.989 |
| 32.0 | 39.281 |
| 32.0 | 39.401 |
| 32.0 | 39.481 |
| 32.0 | 39.498 |
| 32.0 | 38.875 |
| 32.0 | 39.211 |
| 32.0 | 39.358 |
| 32.0 | 39.45 |
| 32.0 | 39.48 |
| 32.0 | 38.769 |
| 32.0 | 39.145 |
| 32.0 | 39.299 |
| 32.0 | 39.409 |
| 32.0 | 39.461 |
| 32.0 | 38.716 |
| 32.0 | 39.066 |
| 32.0 | 39.268 |
| 32.0 | 39.372 |
| 32.0 | 39.44 |
| 36.0 | 39.361 |
| 36.0 | 39.401 |
| 36.0 | 39.446 |
| 36.0 | 39.425 |
| 36.0 | 39.382 |
| 36.0 | 39.301 |
| 36.0 | 39.44 |
| 36.0 | 39.5 |
| 36.0 | 39.491 |
| 36.0 | 39.471 |
| 36.0 | 39.207 |
| 36.0 | 39.396 |
| 36.0 | 39.489 |
| 36.0 | 39.522 |
| 36.0 | 39.503 |
| 36.0 | 39.095 |
| 36.0 | 39.345 |
| 36.0 | 39.472 |
| 36.0 | 39.504 |
| 36.0 | 39.525 |
| 36.0 | 38.983 |
| 36.0 | 39.269 |
| 36.0 | 39.427 |
| 36.0 | 39.49 |
| 36.0 | 39.513 |
| 36.0 | 38.874 |
| 36.0 | 39.199 |
| 36.0 | 39.382 |
| 36.0 | 39.458 |
| 36.0 | 39.494 |
| 36.0 | 38.774 |
| 36.0 | 39.133 |
| 36.0 | 39.322 |
| 36.0 | 39.417 |
| 36.0 | 39.474 |
| 36.0 | 38.714 |
| 36.0 | 39.056 |
| 36.0 | 39.273 |
| 36.0 | 39.376 |
| 36.0 | 39.443 |
| 8.0 | 39.264 |
| 8.0 | 39.215 |
| 8.0 | 39.13 |
| 8.0 | 39.118 |
| 8.0 | 39.046 |
| 8.0 | 39.293 |
| 8.0 | 39.319 |
| 8.0 | 39.241 |
| 8.0 | 39.221 |
| 8.0 | 39.168 |
| 8.0 | 39.278 |
| 8.0 | 39.335 |
| 8.0 | 39.291 |
| 8.0 | 39.293 |
| 8.0 | 39.235 |
| 8.0 | 39.251 |
| 8.0 | 39.332 |
| 8.0 | 39.309 |
| 8.0 | 39.324 |
| 8.0 | 39.281 |
| 8.0 | 39.194 |
| 8.0 | 39.314 |
| 8.0 | 39.31 |
| 8.0 | 39.34 |
| 8.0 | 39.302 |
| 8.0 | 39.149 |
| 8.0 | 39.293 |
| 8.0 | 39.308 |
| 8.0 | 39.336 |
| 8.0 | 39.313 |
| 8.0 | 39.097 |
| 8.0 | 39.262 |
| 8.0 | 39.295 |
| 8.0 | 39.344 |
| 8.0 | 39.317 |
| 8.0 | 39.053 |
| 8.0 | 39.216 |
| 8.0 | 39.275 |
| 8.0 | 39.327 |
| 8.0 | 39.308 |
| 12.0 | 39.308 |
| 12.0 | 39.292 |
| 12.0 | 39.204 |
| 12.0 | 39.205 |
| 12.0 | 39.138 |
| 12.0 | 39.328 |
| 12.0 | 39.389 |
| 12.0 | 39.31 |
| 12.0 | 39.304 |
| 12.0 | 39.258 |
| 12.0 | 39.308 |
| 12.0 | 39.402 |
| 12.0 | 39.356 |
| 12.0 | 39.373 |
| 12.0 | 39.322 |
| 12.0 | 39.279 |
| 12.0 | 39.396 |
| 12.0 | 39.369 |
| 12.0 | 39.402 |
| 12.0 | 39.367 |
| 12.0 | 39.221 |
| 12.0 | 39.378 |
| 12.0 | 39.369 |
| 12.0 | 39.416 |
| 12.0 | 39.388 |
| 12.0 | 39.176 |
| 12.0 | 39.356 |
| 12.0 | 39.366 |
| 12.0 | 39.413 |
| 12.0 | 39.398 |
| 12.0 | 39.123 |
| 12.0 | 39.325 |
| 12.0 | 39.353 |
| 12.0 | 39.42 |
| 12.0 | 39.402 |
| 12.0 | 39.079 |
| 12.0 | 39.278 |
| 12.0 | 39.333 |
| 12.0 | 39.402 |
| 12.0 | 39.392 |
| 16.0 | 39.317 |
| 16.0 | 39.323 |
| 16.0 | 39.238 |
| 16.0 | 39.24 |
| 16.0 | 39.194 |
| 16.0 | 39.331 |
| 16.0 | 39.416 |
| 16.0 | 39.341 |
| 16.0 | 39.336 |
| 16.0 | 39.311 |
| 16.0 | 39.306 |
| 16.0 | 39.424 |
| 16.0 | 39.382 |
| 16.0 | 39.402 |
| 16.0 | 39.374 |
| 16.0 | 39.272 |
| 16.0 | 39.415 |
| 16.0 | 39.393 |
| 16.0 | 39.43 |
| 16.0 | 39.416 |
| 16.0 | 39.214 |
| 16.0 | 39.395 |
| 16.0 | 39.392 |
| 16.0 | 39.442 |
| 16.0 | 39.436 |
| 16.0 | 39.167 |
| 16.0 | 39.372 |
| 16.0 | 39.387 |
| 16.0 | 39.438 |
| 16.0 | 39.445 |
| 16.0 | 39.114 |
| 16.0 | 39.341 |
| 16.0 | 39.374 |
| 16.0 | 39.444 |
| 16.0 | 39.448 |
| 16.0 | 39.069 |
| 16.0 | 39.294 |
| 16.0 | 39.354 |
| 16.0 | 39.426 |
| 16.0 | 39.438 |
| 20.0 | 39.323 |
| 20.0 | 39.337 |
| 20.0 | 39.266 |
| 20.0 | 39.28 |
| 20.0 | 39.221 |
| 20.0 | 39.335 |
| 20.0 | 39.427 |
| 20.0 | 39.366 |
| 20.0 | 39.375 |
| 20.0 | 39.336 |
| 20.0 | 39.307 |
| 20.0 | 39.432 |
| 20.0 | 39.405 |
| 20.0 | 39.438 |
| 20.0 | 39.397 |
| 20.0 | 39.27 |
| 20.0 | 39.42 |
| 20.0 | 39.413 |
| 20.0 | 39.464 |
| 20.0 | 39.438 |
| 20.0 | 39.21 |
| 20.0 | 39.399 |
| 20.0 | 39.41 |
| 20.0 | 39.475 |
| 20.0 | 39.456 |
| 20.0 | 39.159 |
| 20.0 | 39.375 |
| 20.0 | 39.404 |
| 20.0 | 39.469 |
| 20.0 | 39.465 |
| 20.0 | 39.109 |
| 20.0 | 39.342 |
| 20.0 | 39.39 |
| 20.0 | 39.475 |
| 20.0 | 39.468 |
| 20.0 | 39.064 |
| 20.0 | 39.295 |
| 20.0 | 39.369 |
| 20.0 | 39.457 |
| 20.0 | 39.457 |
| 24.0 | 39.308 |
| 24.0 | 39.342 |
| 24.0 | 39.282 |
| 24.0 | 39.308 |
| 24.0 | 39.251 |
| 24.0 | 39.319 |
| 24.0 | 39.431 |
| 24.0 | 39.381 |
| 24.0 | 39.4 |
| 24.0 | 39.366 |
| 24.0 | 39.289 |
| 24.0 | 39.434 |
| 24.0 | 39.419 |
| 24.0 | 39.463 |
| 24.0 | 39.425 |
| 24.0 | 39.251 |
| 24.0 | 39.421 |
| 24.0 | 39.424 |
| 24.0 | 39.487 |
| 24.0 | 39.465 |
| 24.0 | 39.189 |
| 24.0 | 39.397 |
| 24.0 | 39.42 |
| 24.0 | 39.496 |
| 24.0 | 39.482 |
| 24.0 | 39.137 |
| 24.0 | 39.372 |
| 24.0 | 39.413 |
| 24.0 | 39.489 |
| 24.0 | 39.489 |
| 24.0 | 39.086 |
| 24.0 | 39.338 |
| 24.0 | 39.398 |
| 24.0 | 39.494 |
| 24.0 | 39.491 |
| 24.0 | 39.038 |
| 24.0 | 39.291 |
| 24.0 | 39.377 |
| 24.0 | 39.474 |
| 24.0 | 39.48 |
| 28.0 | 39.307 |
| 28.0 | 39.349 |
| 28.0 | 39.296 |
| 28.0 | 39.318 |
| 28.0 | 39.273 |
| 28.0 | 39.317 |
| 28.0 | 39.438 |
| 28.0 | 39.395 |
| 28.0 | 39.411 |
| 28.0 | 39.387 |
| 28.0 | 39.287 |
| 28.0 | 39.44 |
| 28.0 | 39.431 |
| 28.0 | 39.472 |
| 28.0 | 39.445 |
| 28.0 | 39.248 |
| 28.0 | 39.425 |
| 28.0 | 39.435 |
| 28.0 | 39.495 |
| 28.0 | 39.485 |
| 28.0 | 39.186 |
| 28.0 | 39.4 |
| 28.0 | 39.43 |
| 28.0 | 39.503 |
| 28.0 | 39.5 |
| 28.0 | 39.132 |
| 28.0 | 39.373 |
| 28.0 | 39.422 |
| 28.0 | 39.495 |
| 28.0 | 39.506 |
| 28.0 | 39.08 |
| 28.0 | 39.339 |
| 28.0 | 39.405 |
| 28.0 | 39.498 |
| 28.0 | 39.508 |
| 28.0 | 39.031 |
| 28.0 | 39.291 |
| 28.0 | 39.384 |
| 28.0 | 39.479 |
| 28.0 | 39.496 |
| 32.0 | 39.301 |
| 32.0 | 39.349 |
| 32.0 | 39.304 |
| 32.0 | 39.341 |
| 32.0 | 39.29 |
| 32.0 | 39.311 |
| 32.0 | 39.438 |
| 32.0 | 39.401 |
| 32.0 | 39.432 |
| 32.0 | 39.404 |
| 32.0 | 39.28 |
| 32.0 | 39.439 |
| 32.0 | 39.437 |
| 32.0 | 39.489 |
| 32.0 | 39.461 |
| 32.0 | 39.241 |
| 32.0 | 39.424 |
| 32.0 | 39.44 |
| 32.0 | 39.515 |
| 32.0 | 39.5 |
| 32.0 | 39.178 |
| 32.0 | 39.398 |
| 32.0 | 39.434 |
| 32.0 | 39.522 |
| 32.0 | 39.515 |
| 32.0 | 39.124 |
| 32.0 | 39.37 |
| 32.0 | 39.425 |
| 32.0 | 39.513 |
| 32.0 | 39.52 |
| 32.0 | 39.071 |
| 32.0 | 39.335 |
| 32.0 | 39.408 |
| 32.0 | 39.516 |
| 32.0 | 39.521 |
| 32.0 | 39.022 |
| 32.0 | 39.286 |
| 32.0 | 39.385 |
| 32.0 | 39.496 |
| 32.0 | 39.509 |
| 36.0 | 39.298 |
| 36.0 | 39.337 |
| 36.0 | 39.307 |
| 36.0 | 39.341 |
| 36.0 | 39.294 |
| 36.0 | 39.308 |
| 36.0 | 39.425 |
| 36.0 | 39.404 |
| 36.0 | 39.432 |
| 36.0 | 39.408 |
| 36.0 | 39.277 |
| 36.0 | 39.426 |
| 36.0 | 39.439 |
| 36.0 | 39.488 |
| 36.0 | 39.465 |
| 36.0 | 39.237 |
| 36.0 | 39.41 |
| 36.0 | 39.442 |
| 36.0 | 39.51 |
| 36.0 | 39.504 |
| 36.0 | 39.174 |
| 36.0 | 39.384 |
| 36.0 | 39.436 |
| 36.0 | 39.52 |
| 36.0 | 39.518 |
| 36.0 | 39.119 |
| 36.0 | 39.356 |
| 36.0 | 39.426 |
| 36.0 | 39.51 |
| 36.0 | 39.523 |
| 36.0 | 39.066 |
| 36.0 | 39.321 |
| 36.0 | 39.408 |
| 36.0 | 39.513 |
| 36.0 | 39.522 |
| 36.0 | 39.016 |
| 36.0 | 39.272 |
| 36.0 | 39.385 |
| 36.0 | 39.493 |
| 36.0 | 39.51 |
| 8.0 | 39.176 |
| 8.0 | 39.111 |
| 8.0 | 39.074 |
| 8.0 | 39.046 |
| 8.0 | 38.998 |
| 8.0 | 39.205 |
| 8.0 | 39.215 |
| 8.0 | 39.181 |
| 8.0 | 39.157 |
| 8.0 | 39.125 |
| 8.0 | 39.189 |
| 8.0 | 39.229 |
| 8.0 | 39.227 |
| 8.0 | 39.235 |
| 8.0 | 39.193 |
| 8.0 | 39.137 |
| 8.0 | 39.23 |
| 8.0 | 39.254 |
| 8.0 | 39.253 |
| 8.0 | 39.247 |
| 8.0 | 39.089 |
| 8.0 | 39.203 |
| 8.0 | 39.251 |
| 8.0 | 39.276 |
| 8.0 | 39.265 |
| 8.0 | 39.032 |
| 8.0 | 39.172 |
| 8.0 | 39.24 |
| 8.0 | 39.274 |
| 8.0 | 39.271 |
| 8.0 | 38.977 |
| 8.0 | 39.141 |
| 8.0 | 39.215 |
| 8.0 | 39.263 |
| 8.0 | 39.274 |
| 8.0 | 38.934 |
| 8.0 | 39.095 |
| 8.0 | 39.193 |
| 8.0 | 39.25 |
| 8.0 | 39.273 |
| 12.0 | 39.171 |
| 12.0 | 39.167 |
| 12.0 | 39.142 |
| 12.0 | 39.094 |
| 12.0 | 39.035 |
| 12.0 | 39.19 |
| 12.0 | 39.268 |
| 12.0 | 39.244 |
| 12.0 | 39.21 |
| 12.0 | 39.162 |
| 12.0 | 39.165 |
| 12.0 | 39.277 |
| 12.0 | 39.287 |
| 12.0 | 39.281 |
| 12.0 | 39.226 |
| 12.0 | 39.115 |
| 12.0 | 39.277 |
| 12.0 | 39.313 |
| 12.0 | 39.298 |
| 12.0 | 39.279 |
| 12.0 | 39.063 |
| 12.0 | 39.244 |
| 12.0 | 39.309 |
| 12.0 | 39.319 |
| 12.0 | 39.298 |
| 12.0 | 39.005 |
| 12.0 | 39.213 |
| 12.0 | 39.299 |
| 12.0 | 39.316 |
| 12.0 | 39.302 |
| 12.0 | 38.951 |
| 12.0 | 39.184 |
| 12.0 | 39.271 |
| 12.0 | 39.306 |
| 12.0 | 39.305 |
| 12.0 | 38.906 |
| 12.0 | 39.138 |
| 12.0 | 39.248 |
| 12.0 | 39.292 |
| 12.0 | 39.305 |
| 16.0 | 39.145 |
| 16.0 | 39.159 |
| 16.0 | 39.153 |
| 16.0 | 39.142 |
| 16.0 | 39.08 |
| 16.0 | 39.157 |
| 16.0 | 39.25 |
| 16.0 | 39.254 |
| 16.0 | 39.254 |
| 16.0 | 39.199 |
| 16.0 | 39.129 |
| 16.0 | 39.256 |
| 16.0 | 39.289 |
| 16.0 | 39.322 |
| 16.0 | 39.266 |
| 16.0 | 39.075 |
| 16.0 | 39.252 |
| 16.0 | 39.311 |
| 16.0 | 39.337 |
| 16.0 | 39.316 |
| 16.0 | 39.022 |
| 16.0 | 39.221 |
| 16.0 | 39.305 |
| 16.0 | 39.357 |
| 16.0 | 39.332 |
| 16.0 | 38.962 |
| 16.0 | 39.188 |
| 16.0 | 39.296 |
| 16.0 | 39.354 |
| 16.0 | 39.337 |
| 16.0 | 38.905 |
| 16.0 | 39.159 |
| 16.0 | 39.266 |
| 16.0 | 39.342 |
| 16.0 | 39.339 |
| 16.0 | 38.864 |
| 16.0 | 39.112 |
| 16.0 | 39.242 |
| 16.0 | 39.329 |
| 16.0 | 39.338 |
| 20.0 | 39.107 |
| 20.0 | 39.158 |
| 20.0 | 39.162 |
| 20.0 | 39.142 |
| 20.0 | 39.115 |
| 20.0 | 39.113 |
| 20.0 | 39.244 |
| 20.0 | 39.26 |
| 20.0 | 39.252 |
| 20.0 | 39.233 |
| 20.0 | 39.081 |
| 20.0 | 39.244 |
| 20.0 | 39.291 |
| 20.0 | 39.318 |
| 20.0 | 39.297 |
| 20.0 | 39.023 |
| 20.0 | 39.237 |
| 20.0 | 39.31 |
| 20.0 | 39.331 |
| 20.0 | 39.346 |
| 20.0 | 38.967 |
| 20.0 | 39.204 |
| 20.0 | 39.303 |
| 20.0 | 39.349 |
| 20.0 | 39.36 |
| 20.0 | 38.905 |
| 20.0 | 39.17 |
| 20.0 | 39.294 |
| 20.0 | 39.344 |
| 20.0 | 39.364 |
| 20.0 | 38.849 |
| 20.0 | 39.14 |
| 20.0 | 39.264 |
| 20.0 | 39.331 |
| 20.0 | 39.366 |
| 20.0 | 38.808 |
| 20.0 | 39.093 |
| 20.0 | 39.239 |
| 20.0 | 39.317 |
| 20.0 | 39.364 |
| 24.0 | 39.091 |
| 24.0 | 39.13 |
| 24.0 | 39.15 |
| 24.0 | 39.154 |
| 24.0 | 39.115 |
| 24.0 | 39.097 |
| 24.0 | 39.215 |
| 24.0 | 39.246 |
| 24.0 | 39.258 |
| 24.0 | 39.236 |
| 24.0 | 39.066 |
| 24.0 | 39.214 |
| 24.0 | 39.275 |
| 24.0 | 39.322 |
| 24.0 | 39.292 |
| 24.0 | 39.008 |
| 24.0 | 39.207 |
| 24.0 | 39.293 |
| 24.0 | 39.333 |
| 24.0 | 39.345 |
| 24.0 | 38.944 |
| 24.0 | 39.17 |
| 24.0 | 39.284 |
| 24.0 | 39.35 |
| 24.0 | 39.357 |
| 24.0 | 38.88 |
| 24.0 | 39.134 |
| 24.0 | 39.275 |
| 24.0 | 39.344 |
| 24.0 | 39.361 |
| 24.0 | 38.823 |
| 24.0 | 39.103 |
| 24.0 | 39.245 |
| 24.0 | 39.331 |
| 24.0 | 39.362 |
| 24.0 | 38.78 |
| 24.0 | 39.055 |
| 24.0 | 39.22 |
| 24.0 | 39.316 |
| 24.0 | 39.359 |
| 28.0 | 39.084 |
| 28.0 | 39.111 |
| 28.0 | 39.161 |
| 28.0 | 39.154 |
| 28.0 | 39.116 |
| 28.0 | 39.089 |
| 28.0 | 39.194 |
| 28.0 | 39.251 |
| 28.0 | 39.256 |
| 28.0 | 39.234 |
| 28.0 | 39.055 |
| 28.0 | 39.19 |
| 28.0 | 39.274 |
| 28.0 | 39.318 |
| 28.0 | 39.288 |
| 28.0 | 38.996 |
| 28.0 | 39.181 |
| 28.0 | 39.289 |
| 28.0 | 39.329 |
| 28.0 | 39.339 |
| 28.0 | 38.93 |
| 28.0 | 39.142 |
| 28.0 | 39.275 |
| 28.0 | 39.343 |
| 28.0 | 39.349 |
| 28.0 | 38.865 |
| 28.0 | 39.105 |
| 28.0 | 39.261 |
| 28.0 | 39.336 |
| 28.0 | 39.353 |
| 28.0 | 38.808 |
| 28.0 | 39.073 |
| 28.0 | 39.231 |
| 28.0 | 39.322 |
| 28.0 | 39.353 |
| 28.0 | 38.766 |
| 28.0 | 39.024 |
| 28.0 | 39.205 |
| 28.0 | 39.307 |
| 28.0 | 39.35 |
| 32.0 | 39.082 |
| 32.0 | 39.105 |
| 32.0 | 39.137 |
| 32.0 | 39.144 |
| 32.0 | 39.122 |
| 32.0 | 39.084 |
| 32.0 | 39.186 |
| 32.0 | 39.225 |
| 32.0 | 39.244 |
| 32.0 | 39.24 |
| 32.0 | 39.042 |
| 32.0 | 39.18 |
| 32.0 | 39.248 |
| 32.0 | 39.306 |
| 32.0 | 39.293 |
| 32.0 | 38.98 |
| 32.0 | 39.169 |
| 32.0 | 39.263 |
| 32.0 | 39.315 |
| 32.0 | 39.342 |
| 32.0 | 38.913 |
| 32.0 | 39.129 |
| 32.0 | 39.251 |
| 32.0 | 39.328 |
| 32.0 | 39.352 |
| 32.0 | 38.847 |
| 32.0 | 39.091 |
| 32.0 | 39.236 |
| 32.0 | 39.32 |
| 32.0 | 39.355 |
| 32.0 | 38.792 |
| 32.0 | 39.054 |
| 32.0 | 39.205 |
| 32.0 | 39.306 |
| 32.0 | 39.353 |
| 32.0 | 38.748 |
| 32.0 | 39.008 |
| 32.0 | 39.174 |
| 32.0 | 39.29 |
| 32.0 | 39.348 |
| 36.0 | 39.081 |
| 36.0 | 39.094 |
| 36.0 | 39.121 |
| 36.0 | 39.138 |
| 36.0 | 39.117 |
| 36.0 | 39.076 |
| 36.0 | 39.174 |
| 36.0 | 39.209 |
| 36.0 | 39.237 |
| 36.0 | 39.235 |
| 36.0 | 39.035 |
| 36.0 | 39.168 |
| 36.0 | 39.232 |
| 36.0 | 39.297 |
| 36.0 | 39.289 |
| 36.0 | 38.971 |
| 36.0 | 39.156 |
| 36.0 | 39.246 |
| 36.0 | 39.305 |
| 36.0 | 39.339 |
| 36.0 | 38.904 |
| 36.0 | 39.115 |
| 36.0 | 39.234 |
| 36.0 | 39.318 |
| 36.0 | 39.348 |
| 36.0 | 38.836 |
| 36.0 | 39.076 |
| 36.0 | 39.219 |
| 36.0 | 39.31 |
| 36.0 | 39.352 |
| 36.0 | 38.78 |
| 36.0 | 39.042 |
| 36.0 | 39.186 |
| 36.0 | 39.294 |
| 36.0 | 39.349 |
| 36.0 | 38.737 |
| 36.0 | 38.991 |
| 36.0 | 39.158 |
| 36.0 | 39.277 |
| 36.0 | 39.336 |
| 8.0 | 38.992 |
| 8.0 | 39.001 |
| 8.0 | 38.974 |
| 8.0 | 38.928 |
| 8.0 | 38.875 |
| 8.0 | 38.978 |
| 8.0 | 39.044 |
| 8.0 | 39.046 |
| 8.0 | 39.014 |
| 8.0 | 38.985 |
| 8.0 | 38.931 |
| 8.0 | 39.043 |
| 8.0 | 39.07 |
| 8.0 | 39.057 |
| 8.0 | 39.045 |
| 8.0 | 38.875 |
| 8.0 | 39.024 |
| 8.0 | 39.071 |
| 8.0 | 39.088 |
| 8.0 | 39.077 |
| 8.0 | 38.854 |
| 8.0 | 38.987 |
| 8.0 | 39.043 |
| 8.0 | 39.09 |
| 8.0 | 39.091 |
| 8.0 | 38.846 |
| 8.0 | 38.946 |
| 8.0 | 39.03 |
| 8.0 | 39.072 |
| 8.0 | 39.081 |
| 8.0 | 38.802 |
| 8.0 | 38.935 |
| 8.0 | 39.004 |
| 8.0 | 39.049 |
| 8.0 | 39.065 |
| 8.0 | 38.799 |
| 8.0 | 38.913 |
| 8.0 | 38.98 |
| 8.0 | 39.028 |
| 8.0 | 39.052 |
| 12.0 | 38.917 |
| 12.0 | 38.982 |
| 12.0 | 38.979 |
| 12.0 | 38.95 |
| 12.0 | 38.903 |
| 12.0 | 38.895 |
| 12.0 | 39.016 |
| 12.0 | 39.046 |
| 12.0 | 39.046 |
| 12.0 | 39.006 |
| 12.0 | 38.841 |
| 12.0 | 39.005 |
| 12.0 | 39.064 |
| 12.0 | 39.086 |
| 12.0 | 39.063 |
| 12.0 | 38.78 |
| 12.0 | 38.987 |
| 12.0 | 39.063 |
| 12.0 | 39.116 |
| 12.0 | 39.095 |
| 12.0 | 38.756 |
| 12.0 | 38.948 |
| 12.0 | 39.036 |
| 12.0 | 39.116 |
| 12.0 | 39.109 |
| 12.0 | 38.742 |
| 12.0 | 38.9 |
| 12.0 | 39.022 |
| 12.0 | 39.097 |
| 12.0 | 39.097 |
| 12.0 | 38.699 |
| 12.0 | 38.891 |
| 12.0 | 38.994 |
| 12.0 | 39.072 |
| 12.0 | 39.081 |
| 12.0 | 38.694 |
| 12.0 | 38.867 |
| 12.0 | 38.969 |
| 12.0 | 39.048 |
| 12.0 | 39.067 |
| 16.0 | 38.873 |
| 16.0 | 38.933 |
| 16.0 | 38.956 |
| 16.0 | 38.95 |
| 16.0 | 38.918 |
| 16.0 | 38.84 |
| 16.0 | 38.957 |
| 16.0 | 39.019 |
| 16.0 | 39.043 |
| 16.0 | 39.017 |
| 16.0 | 38.78 |
| 16.0 | 38.956 |
| 16.0 | 39.044 |
| 16.0 | 39.08 |
| 16.0 | 39.077 |
| 16.0 | 38.715 |
| 16.0 | 38.935 |
| 16.0 | 39.039 |
| 16.0 | 39.108 |
| 16.0 | 39.106 |
| 16.0 | 38.689 |
| 16.0 | 38.894 |
| 16.0 | 39.011 |
| 16.0 | 39.107 |
| 16.0 | 39.119 |
| 16.0 | 38.669 |
| 16.0 | 38.844 |
| 16.0 | 38.995 |
| 16.0 | 39.083 |
| 16.0 | 39.107 |
| 16.0 | 38.627 |
| 16.0 | 38.833 |
| 16.0 | 38.966 |
| 16.0 | 39.056 |
| 16.0 | 39.09 |
| 16.0 | 38.621 |
| 16.0 | 38.808 |
| 16.0 | 38.94 |
| 16.0 | 39.036 |
| 16.0 | 39.075 |
| 20.0 | 38.826 |
| 20.0 | 38.922 |
| 20.0 | 38.925 |
| 20.0 | 38.952 |
| 20.0 | 38.914 |
| 20.0 | 38.784 |
| 20.0 | 38.937 |
| 20.0 | 38.984 |
| 20.0 | 39.04 |
| 20.0 | 39.011 |
| 20.0 | 38.718 |
| 20.0 | 38.93 |
| 20.0 | 39.005 |
| 20.0 | 39.075 |
| 20.0 | 39.069 |
| 20.0 | 38.662 |
| 20.0 | 38.893 |
| 20.0 | 38.997 |
| 20.0 | 39.085 |
| 20.0 | 39.096 |
| 20.0 | 38.633 |
| 20.0 | 38.849 |
| 20.0 | 38.967 |
| 20.0 | 39.078 |
| 20.0 | 39.107 |
| 20.0 | 38.61 |
| 20.0 | 38.798 |
| 20.0 | 38.946 |
| 20.0 | 39.056 |
| 20.0 | 39.094 |
| 20.0 | 38.566 |
| 20.0 | 38.784 |
| 20.0 | 38.92 |
| 20.0 | 39.029 |
| 20.0 | 39.076 |
| 20.0 | 38.558 |
| 20.0 | 38.758 |
| 20.0 | 38.893 |
| 20.0 | 39.008 |
| 20.0 | 39.061 |
| 24.0 | 38.797 |
| 24.0 | 38.9 |
| 24.0 | 38.896 |
| 24.0 | 38.933 |
| 24.0 | 38.911 |
| 24.0 | 38.752 |
| 24.0 | 38.909 |
| 24.0 | 38.949 |
| 24.0 | 39.017 |
| 24.0 | 39.005 |
| 24.0 | 38.681 |
| 24.0 | 38.897 |
| 24.0 | 38.967 |
| 24.0 | 39.046 |
| 24.0 | 39.062 |
| 24.0 | 38.62 |
| 24.0 | 38.857 |
| 24.0 | 38.956 |
| 24.0 | 39.054 |
| 24.0 | 39.087 |
| 24.0 | 38.584 |
| 24.0 | 38.81 |
| 24.0 | 38.919 |
| 24.0 | 39.049 |
| 24.0 | 39.091 |
| 24.0 | 38.558 |
| 24.0 | 38.758 |
| 24.0 | 38.9 |
| 24.0 | 39.025 |
| 24.0 | 39.076 |
| 24.0 | 38.514 |
| 24.0 | 38.743 |
| 24.0 | 38.873 |
| 24.0 | 38.997 |
| 24.0 | 39.057 |
| 24.0 | 38.504 |
| 24.0 | 38.717 |
| 24.0 | 38.845 |
| 24.0 | 38.975 |
| 24.0 | 39.042 |
| 28.0 | 38.814 |
| 28.0 | 38.859 |
| 28.0 | 38.891 |
| 28.0 | 38.905 |
| 28.0 | 38.885 |
| 28.0 | 38.764 |
| 28.0 | 38.866 |
| 28.0 | 38.94 |
| 28.0 | 38.983 |
| 28.0 | 38.976 |
| 28.0 | 38.692 |
| 28.0 | 38.851 |
| 28.0 | 38.953 |
| 28.0 | 39.01 |
| 28.0 | 39.03 |
| 28.0 | 38.626 |
| 28.0 | 38.809 |
| 28.0 | 38.94 |
| 28.0 | 39.015 |
| 28.0 | 39.053 |
| 28.0 | 38.589 |
| 28.0 | 38.762 |
| 28.0 | 38.902 |
| 28.0 | 39.008 |
| 28.0 | 39.056 |
| 28.0 | 38.548 |
| 28.0 | 38.717 |
| 28.0 | 38.881 |
| 28.0 | 38.984 |
| 28.0 | 39.049 |
| 28.0 | 38.503 |
| 28.0 | 38.7 |
| 28.0 | 38.852 |
| 28.0 | 38.954 |
| 28.0 | 39.024 |
| 28.0 | 38.492 |
| 28.0 | 38.673 |
| 28.0 | 38.823 |
| 28.0 | 38.93 |
| 28.0 | 39.008 |
| 32.0 | 38.796 |
| 32.0 | 38.856 |
| 32.0 | 38.885 |
| 32.0 | 38.888 |
| 32.0 | 38.86 |
| 32.0 | 38.748 |
| 32.0 | 38.863 |
| 32.0 | 38.931 |
| 32.0 | 38.963 |
| 32.0 | 38.946 |
| 32.0 | 38.674 |
| 32.0 | 38.845 |
| 32.0 | 38.94 |
| 32.0 | 38.992 |
| 32.0 | 38.999 |
| 32.0 | 38.608 |
| 32.0 | 38.799 |
| 32.0 | 38.922 |
| 32.0 | 38.992 |
| 32.0 | 39.02 |
| 32.0 | 38.569 |
| 32.0 | 38.748 |
| 32.0 | 38.886 |
| 32.0 | 38.984 |
| 32.0 | 39.022 |
| 32.0 | 38.526 |
| 32.0 | 38.701 |
| 32.0 | 38.862 |
| 32.0 | 38.959 |
| 32.0 | 39.01 |
| 32.0 | 38.489 |
| 32.0 | 38.668 |
| 32.0 | 38.821 |
| 32.0 | 38.941 |
| 32.0 | 38.987 |
| 32.0 | 38.477 |
| 32.0 | 38.64 |
| 32.0 | 38.791 |
| 32.0 | 38.917 |
| 32.0 | 38.97 |
| 36.0 | 38.802 |
| 36.0 | 38.835 |
| 36.0 | 38.87 |
| 36.0 | 38.886 |
| 36.0 | 38.854 |
| 36.0 | 38.752 |
| 36.0 | 38.84 |
| 36.0 | 38.912 |
| 36.0 | 38.958 |
| 36.0 | 38.939 |
| 36.0 | 38.676 |
| 36.0 | 38.819 |
| 36.0 | 38.919 |
| 36.0 | 38.985 |
| 36.0 | 38.989 |
| 36.0 | 38.608 |
| 36.0 | 38.771 |
| 36.0 | 38.899 |
| 36.0 | 38.98 |
| 36.0 | 39.009 |
| 36.0 | 38.567 |
| 36.0 | 38.718 |
| 36.0 | 38.862 |
| 36.0 | 38.97 |
| 36.0 | 39.01 |
| 36.0 | 38.523 |
| 36.0 | 38.669 |
| 36.0 | 38.837 |
| 36.0 | 38.943 |
| 36.0 | 38.997 |
| 36.0 | 38.485 |
| 36.0 | 38.635 |
| 36.0 | 38.795 |
| 36.0 | 38.924 |
| 36.0 | 38.972 |
| 36.0 | 38.462 |
| 36.0 | 38.606 |
| 36.0 | 38.764 |
| 36.0 | 38.886 |
| 36.0 | 38.948 |
| 8.0 | 38.864 |
| 8.0 | 38.869 |
| 8.0 | 38.888 |
| 8.0 | 38.839 |
| 8.0 | 38.791 |
| 8.0 | 38.866 |
| 8.0 | 38.942 |
| 8.0 | 38.966 |
| 8.0 | 38.949 |
| 8.0 | 38.906 |
| 8.0 | 38.858 |
| 8.0 | 38.934 |
| 8.0 | 38.977 |
| 8.0 | 38.997 |
| 8.0 | 38.952 |
| 8.0 | 38.847 |
| 8.0 | 38.939 |
| 8.0 | 38.987 |
| 8.0 | 38.987 |
| 8.0 | 38.99 |
| 8.0 | 38.824 |
| 8.0 | 38.908 |
| 8.0 | 38.976 |
| 8.0 | 38.997 |
| 8.0 | 38.986 |
| 8.0 | 38.801 |
| 8.0 | 38.904 |
| 8.0 | 38.972 |
| 8.0 | 38.983 |
| 8.0 | 38.981 |
| 8.0 | 38.805 |
| 8.0 | 38.901 |
| 8.0 | 38.947 |
| 8.0 | 38.976 |
| 8.0 | 38.972 |
| 8.0 | 38.804 |
| 8.0 | 38.882 |
| 8.0 | 38.944 |
| 8.0 | 38.962 |
| 8.0 | 38.963 |
| 12.0 | 38.766 |
| 12.0 | 38.823 |
| 12.0 | 38.866 |
| 12.0 | 38.845 |
| 12.0 | 38.819 |
| 12.0 | 38.754 |
| 12.0 | 38.884 |
| 12.0 | 38.938 |
| 12.0 | 38.942 |
| 12.0 | 38.932 |
| 12.0 | 38.738 |
| 12.0 | 38.87 |
| 12.0 | 38.941 |
| 12.0 | 38.99 |
| 12.0 | 38.975 |
| 12.0 | 38.721 |
| 12.0 | 38.874 |
| 12.0 | 38.951 |
| 12.0 | 38.978 |
| 12.0 | 39.008 |
| 12.0 | 38.692 |
| 12.0 | 38.838 |
| 12.0 | 38.937 |
| 12.0 | 38.985 |
| 12.0 | 39.002 |
| 12.0 | 38.667 |
| 12.0 | 38.833 |
| 12.0 | 38.932 |
| 12.0 | 38.969 |
| 12.0 | 39 |
| 12.0 | 38.673 |
| 12.0 | 38.826 |
| 12.0 | 38.904 |
| 12.0 | 38.959 |
| 12.0 | 38.99 |
| 12.0 | 38.668 |
| 12.0 | 38.805 |
| 12.0 | 38.9 |
| 12.0 | 38.943 |
| 12.0 | 38.978 |
| 16.0 | 38.714 |
| 16.0 | 38.764 |
| 16.0 | 38.798 |
| 16.0 | 38.827 |
| 16.0 | 38.794 |
| 16.0 | 38.684 |
| 16.0 | 38.813 |
| 16.0 | 38.859 |
| 16.0 | 38.919 |
| 16.0 | 38.903 |
| 16.0 | 38.654 |
| 16.0 | 38.793 |
| 16.0 | 38.862 |
| 16.0 | 38.963 |
| 16.0 | 38.945 |
| 16.0 | 38.631 |
| 16.0 | 38.793 |
| 16.0 | 38.867 |
| 16.0 | 38.949 |
| 16.0 | 38.979 |
| 16.0 | 38.603 |
| 16.0 | 38.754 |
| 16.0 | 38.851 |
| 16.0 | 38.951 |
| 16.0 | 38.972 |
| 16.0 | 38.573 |
| 16.0 | 38.745 |
| 16.0 | 38.842 |
| 16.0 | 38.936 |
| 16.0 | 38.968 |
| 16.0 | 38.576 |
| 16.0 | 38.738 |
| 16.0 | 38.811 |
| 16.0 | 38.925 |
| 16.0 | 38.956 |
| 16.0 | 38.574 |
| 16.0 | 38.714 |
| 16.0 | 38.807 |
| 16.0 | 38.906 |
| 16.0 | 38.944 |
| 20.0 | 38.699 |
| 20.0 | 38.73 |
| 20.0 | 38.771 |
| 20.0 | 38.764 |
| 20.0 | 38.775 |
| 20.0 | 38.656 |
| 20.0 | 38.769 |
| 20.0 | 38.828 |
| 20.0 | 38.851 |
| 20.0 | 38.88 |
| 20.0 | 38.615 |
| 20.0 | 38.741 |
| 20.0 | 38.824 |
| 20.0 | 38.892 |
| 20.0 | 38.919 |
| 20.0 | 38.583 |
| 20.0 | 38.734 |
| 20.0 | 38.827 |
| 20.0 | 38.874 |
| 20.0 | 38.95 |
| 20.0 | 38.554 |
| 20.0 | 38.692 |
| 20.0 | 38.808 |
| 20.0 | 38.877 |
| 20.0 | 38.941 |
| 20.0 | 38.518 |
| 20.0 | 38.682 |
| 20.0 | 38.799 |
| 20.0 | 38.861 |
| 20.0 | 38.937 |
| 20.0 | 38.523 |
| 20.0 | 38.672 |
| 20.0 | 38.765 |
| 20.0 | 38.848 |
| 20.0 | 38.924 |
| 20.0 | 38.522 |
| 20.0 | 38.648 |
| 20.0 | 38.761 |
| 20.0 | 38.828 |
| 20.0 | 38.911 |
| 24.0 | 38.672 |
| 24.0 | 38.694 |
| 24.0 | 38.74 |
| 24.0 | 38.752 |
| 24.0 | 38.732 |
| 24.0 | 38.625 |
| 24.0 | 38.723 |
| 24.0 | 38.788 |
| 24.0 | 38.83 |
| 24.0 | 38.832 |
| 24.0 | 38.576 |
| 24.0 | 38.687 |
| 24.0 | 38.778 |
| 24.0 | 38.863 |
| 24.0 | 38.868 |
| 24.0 | 38.544 |
| 24.0 | 38.674 |
| 24.0 | 38.777 |
| 24.0 | 38.846 |
| 24.0 | 38.897 |
| 24.0 | 38.512 |
| 24.0 | 38.629 |
| 24.0 | 38.755 |
| 24.0 | 38.847 |
| 24.0 | 38.887 |
| 24.0 | 38.476 |
| 24.0 | 38.616 |
| 24.0 | 38.741 |
| 24.0 | 38.829 |
| 24.0 | 38.88 |
| 24.0 | 38.478 |
| 24.0 | 38.605 |
| 24.0 | 38.71 |
| 24.0 | 38.815 |
| 24.0 | 38.866 |
| 24.0 | 38.476 |
| 24.0 | 38.578 |
| 24.0 | 38.7 |
| 24.0 | 38.794 |
| 24.0 | 38.852 |
| 28.0 | 38.656 |
| 28.0 | 38.692 |
| 28.0 | 38.714 |
| 28.0 | 38.732 |
| 28.0 | 38.714 |
| 28.0 | 38.607 |
| 28.0 | 38.717 |
| 28.0 | 38.758 |
| 28.0 | 38.803 |
| 28.0 | 38.806 |
| 28.0 | 38.555 |
| 28.0 | 38.675 |
| 28.0 | 38.744 |
| 28.0 | 38.834 |
| 28.0 | 38.838 |
| 28.0 | 38.519 |
| 28.0 | 38.656 |
| 28.0 | 38.736 |
| 28.0 | 38.814 |
| 28.0 | 38.865 |
| 28.0 | 38.48 |
| 28.0 | 38.607 |
| 28.0 | 38.714 |
| 28.0 | 38.814 |
| 28.0 | 38.852 |
| 28.0 | 38.444 |
| 28.0 | 38.59 |
| 28.0 | 38.698 |
| 28.0 | 38.79 |
| 28.0 | 38.845 |
| 28.0 | 38.446 |
| 28.0 | 38.576 |
| 28.0 | 38.662 |
| 28.0 | 38.774 |
| 28.0 | 38.83 |
| 28.0 | 38.443 |
| 28.0 | 38.549 |
| 28.0 | 38.655 |
| 28.0 | 38.752 |
| 28.0 | 38.815 |
| 32.0 | 38.647 |
| 32.0 | 38.686 |
| 32.0 | 38.697 |
| 32.0 | 38.711 |
| 32.0 | 38.702 |
| 32.0 | 38.595 |
| 32.0 | 38.71 |
| 32.0 | 38.733 |
| 32.0 | 38.775 |
| 32.0 | 38.791 |
| 32.0 | 38.538 |
| 32.0 | 38.665 |
| 32.0 | 38.711 |
| 32.0 | 38.801 |
| 32.0 | 38.817 |
| 32.0 | 38.499 |
| 32.0 | 38.642 |
| 32.0 | 38.701 |
| 32.0 | 38.776 |
| 32.0 | 38.841 |
| 32.0 | 38.461 |
| 32.0 | 38.589 |
| 32.0 | 38.673 |
| 32.0 | 38.773 |
| 32.0 | 38.827 |
| 32.0 | 38.423 |
| 32.0 | 38.569 |
| 32.0 | 38.654 |
| 32.0 | 38.748 |
| 32.0 | 38.818 |
| 32.0 | 38.414 |
| 32.0 | 38.555 |
| 32.0 | 38.616 |
| 32.0 | 38.729 |
| 32.0 | 38.801 |
| 32.0 | 38.41 |
| 32.0 | 38.526 |
| 32.0 | 38.607 |
| 32.0 | 38.706 |
| 32.0 | 38.786 |
| 36.0 | 38.624 |
| 36.0 | 38.67 |
| 36.0 | 38.688 |
| 36.0 | 38.682 |
| 36.0 | 38.687 |
| 36.0 | 38.569 |
| 36.0 | 38.691 |
| 36.0 | 38.728 |
| 36.0 | 38.743 |
| 36.0 | 38.771 |
| 36.0 | 38.513 |
| 36.0 | 38.645 |
| 36.0 | 38.705 |
| 36.0 | 38.767 |
| 36.0 | 38.795 |
| 36.0 | 38.475 |
| 36.0 | 38.62 |
| 36.0 | 38.69 |
| 36.0 | 38.741 |
| 36.0 | 38.814 |
| 36.0 | 38.436 |
| 36.0 | 38.565 |
| 36.0 | 38.661 |
| 36.0 | 38.734 |
| 36.0 | 38.798 |
| 36.0 | 38.396 |
| 36.0 | 38.542 |
| 36.0 | 38.64 |
| 36.0 | 38.708 |
| 36.0 | 38.787 |
| 36.0 | 38.384 |
| 36.0 | 38.526 |
| 36.0 | 38.6 |
| 36.0 | 38.688 |
| 36.0 | 38.77 |
| 36.0 | 38.387 |
| 36.0 | 38.496 |
| 36.0 | 38.591 |
| 36.0 | 38.668 |
| 36.0 | 38.749 |
| 8.0 | 38.813 |
| 8.0 | 38.804 |
| 8.0 | 38.792 |
| 8.0 | 38.803 |
| 8.0 | 38.747 |
| 8.0 | 38.818 |
| 8.0 | 38.887 |
| 8.0 | 38.875 |
| 8.0 | 38.878 |
| 8.0 | 38.848 |
| 8.0 | 38.816 |
| 8.0 | 38.886 |
| 8.0 | 38.903 |
| 8.0 | 38.92 |
| 8.0 | 38.896 |
| 8.0 | 38.818 |
| 8.0 | 38.875 |
| 8.0 | 38.902 |
| 8.0 | 38.931 |
| 8.0 | 38.92 |
| 8.0 | 38.768 |
| 8.0 | 38.864 |
| 8.0 | 38.895 |
| 8.0 | 38.934 |
| 8.0 | 38.924 |
| 8.0 | 38.783 |
| 8.0 | 38.88 |
| 8.0 | 38.881 |
| 8.0 | 38.931 |
| 8.0 | 38.922 |
| 8.0 | 38.786 |
| 8.0 | 38.875 |
| 8.0 | 38.889 |
| 8.0 | 38.934 |
| 8.0 | 38.924 |
| 8.0 | 38.762 |
| 8.0 | 38.849 |
| 8.0 | 38.891 |
| 8.0 | 38.924 |
| 8.0 | 38.913 |
| 12.0 | 38.668 |
| 12.0 | 38.742 |
| 12.0 | 38.742 |
| 12.0 | 38.762 |
| 12.0 | 38.74 |
| 12.0 | 38.653 |
| 12.0 | 38.805 |
| 12.0 | 38.818 |
| 12.0 | 38.833 |
| 12.0 | 38.841 |
| 12.0 | 38.642 |
| 12.0 | 38.802 |
| 12.0 | 38.842 |
| 12.0 | 38.876 |
| 12.0 | 38.887 |
| 12.0 | 38.638 |
| 12.0 | 38.786 |
| 12.0 | 38.841 |
| 12.0 | 38.884 |
| 12.0 | 38.904 |
| 12.0 | 38.584 |
| 12.0 | 38.77 |
| 12.0 | 38.83 |
| 12.0 | 38.882 |
| 12.0 | 38.907 |
| 12.0 | 38.594 |
| 12.0 | 38.783 |
| 12.0 | 38.814 |
| 12.0 | 38.876 |
| 12.0 | 38.905 |
| 12.0 | 38.597 |
| 12.0 | 38.777 |
| 12.0 | 38.819 |
| 12.0 | 38.878 |
| 12.0 | 38.905 |
| 12.0 | 38.574 |
| 12.0 | 38.75 |
| 12.0 | 38.82 |
| 12.0 | 38.865 |
| 12.0 | 38.894 |
| 16.0 | 38.645 |
| 16.0 | 38.657 |
| 16.0 | 38.679 |
| 16.0 | 38.712 |
| 16.0 | 38.702 |
| 16.0 | 38.609 |
| 16.0 | 38.709 |
| 16.0 | 38.747 |
| 16.0 | 38.777 |
| 16.0 | 38.8 |
| 16.0 | 38.586 |
| 16.0 | 38.696 |
| 16.0 | 38.766 |
| 16.0 | 38.816 |
| 16.0 | 38.838 |
| 16.0 | 38.577 |
| 16.0 | 38.674 |
| 16.0 | 38.761 |
| 16.0 | 38.821 |
| 16.0 | 38.857 |
| 16.0 | 38.519 |
| 16.0 | 38.655 |
| 16.0 | 38.747 |
| 16.0 | 38.817 |
| 16.0 | 38.858 |
| 16.0 | 38.526 |
| 16.0 | 38.664 |
| 16.0 | 38.727 |
| 16.0 | 38.808 |
| 16.0 | 38.855 |
| 16.0 | 38.528 |
| 16.0 | 38.656 |
| 16.0 | 38.73 |
| 16.0 | 38.806 |
| 16.0 | 38.852 |
| 16.0 | 38.504 |
| 16.0 | 38.627 |
| 16.0 | 38.729 |
| 16.0 | 38.792 |
| 16.0 | 38.838 |
| 20.0 | 38.627 |
| 20.0 | 38.623 |
| 20.0 | 38.628 |
| 20.0 | 38.663 |
| 20.0 | 38.652 |
| 20.0 | 38.58 |
| 20.0 | 38.657 |
| 20.0 | 38.686 |
| 20.0 | 38.725 |
| 20.0 | 38.744 |
| 20.0 | 38.544 |
| 20.0 | 38.634 |
| 20.0 | 38.698 |
| 20.0 | 38.759 |
| 20.0 | 38.779 |
| 20.0 | 38.528 |
| 20.0 | 38.604 |
| 20.0 | 38.686 |
| 20.0 | 38.762 |
| 20.0 | 38.796 |
| 20.0 | 38.468 |
| 20.0 | 38.582 |
| 20.0 | 38.669 |
| 20.0 | 38.755 |
| 20.0 | 38.795 |
| 20.0 | 38.473 |
| 20.0 | 38.588 |
| 20.0 | 38.646 |
| 20.0 | 38.744 |
| 20.0 | 38.79 |
| 20.0 | 38.474 |
| 20.0 | 38.577 |
| 20.0 | 38.647 |
| 20.0 | 38.74 |
| 20.0 | 38.787 |
| 20.0 | 38.45 |
| 20.0 | 38.544 |
| 20.0 | 38.641 |
| 20.0 | 38.721 |
| 20.0 | 38.767 |
| 24.0 | 38.566 |
| 24.0 | 38.604 |
| 24.0 | 38.584 |
| 24.0 | 38.632 |
| 24.0 | 38.623 |
| 24.0 | 38.513 |
| 24.0 | 38.628 |
| 24.0 | 38.631 |
| 24.0 | 38.681 |
| 24.0 | 38.702 |
| 24.0 | 38.47 |
| 24.0 | 38.595 |
| 24.0 | 38.634 |
| 24.0 | 38.709 |
| 24.0 | 38.737 |
| 24.0 | 38.447 |
| 24.0 | 38.56 |
| 24.0 | 38.617 |
| 24.0 | 38.709 |
| 24.0 | 38.752 |
| 24.0 | 38.416 |
| 24.0 | 38.543 |
| 24.0 | 38.597 |
| 24.0 | 38.7 |
| 24.0 | 38.75 |
| 24.0 | 38.417 |
| 24.0 | 38.546 |
| 24.0 | 38.572 |
| 24.0 | 38.687 |
| 24.0 | 38.743 |
| 24.0 | 38.421 |
| 24.0 | 38.534 |
| 24.0 | 38.572 |
| 24.0 | 38.681 |
| 24.0 | 38.738 |
| 24.0 | 38.397 |
| 24.0 | 38.5 |
| 24.0 | 38.565 |
| 24.0 | 38.66 |
| 24.0 | 38.718 |
| 28.0 | 38.585 |
| 28.0 | 38.604 |
| 28.0 | 38.584 |
| 28.0 | 38.599 |
| 28.0 | 38.599 |
| 28.0 | 38.529 |
| 28.0 | 38.626 |
| 28.0 | 38.623 |
| 28.0 | 38.641 |
| 28.0 | 38.674 |
| 28.0 | 38.482 |
| 28.0 | 38.587 |
| 28.0 | 38.619 |
| 28.0 | 38.66 |
| 28.0 | 38.703 |
| 28.0 | 38.456 |
| 28.0 | 38.545 |
| 28.0 | 38.596 |
| 28.0 | 38.655 |
| 28.0 | 38.714 |
| 28.0 | 38.42 |
| 28.0 | 38.524 |
| 28.0 | 38.575 |
| 28.0 | 38.644 |
| 28.0 | 38.709 |
| 28.0 | 38.39 |
| 28.0 | 38.516 |
| 28.0 | 38.552 |
| 28.0 | 38.626 |
| 28.0 | 38.695 |
| 28.0 | 38.391 |
| 28.0 | 38.502 |
| 28.0 | 38.55 |
| 28.0 | 38.618 |
| 28.0 | 38.69 |
| 28.0 | 38.366 |
| 28.0 | 38.467 |
| 28.0 | 38.542 |
| 28.0 | 38.596 |
| 28.0 | 38.669 |
| 32.0 | 38.589 |
| 32.0 | 38.591 |
| 32.0 | 38.578 |
| 32.0 | 38.594 |
| 32.0 | 38.575 |
| 32.0 | 38.533 |
| 32.0 | 38.609 |
| 32.0 | 38.615 |
| 32.0 | 38.63 |
| 32.0 | 38.644 |
| 32.0 | 38.485 |
| 32.0 | 38.569 |
| 32.0 | 38.606 |
| 32.0 | 38.644 |
| 32.0 | 38.667 |
| 32.0 | 38.457 |
| 32.0 | 38.522 |
| 32.0 | 38.578 |
| 32.0 | 38.633 |
| 32.0 | 38.675 |
| 32.0 | 38.422 |
| 32.0 | 38.497 |
| 32.0 | 38.554 |
| 32.0 | 38.618 |
| 32.0 | 38.668 |
| 32.0 | 38.389 |
| 32.0 | 38.486 |
| 32.0 | 38.528 |
| 32.0 | 38.598 |
| 32.0 | 38.652 |
| 32.0 | 38.388 |
| 32.0 | 38.471 |
| 32.0 | 38.525 |
| 32.0 | 38.589 |
| 32.0 | 38.647 |
| 32.0 | 38.363 |
| 32.0 | 38.435 |
| 32.0 | 38.515 |
| 32.0 | 38.566 |
| 32.0 | 38.625 |
| 36.0 | 38.564 |
| 36.0 | 38.561 |
| 36.0 | 38.572 |
| 36.0 | 38.594 |
| 36.0 | 38.547 |
| 36.0 | 38.508 |
| 36.0 | 38.576 |
| 36.0 | 38.606 |
| 36.0 | 38.628 |
| 36.0 | 38.611 |
| 36.0 | 38.462 |
| 36.0 | 38.532 |
| 36.0 | 38.596 |
| 36.0 | 38.637 |
| 36.0 | 38.63 |
| 36.0 | 38.432 |
| 36.0 | 38.481 |
| 36.0 | 38.561 |
| 36.0 | 38.62 |
| 36.0 | 38.63 |
| 36.0 | 38.397 |
| 36.0 | 38.453 |
| 36.0 | 38.534 |
| 36.0 | 38.6 |
| 36.0 | 38.618 |
| 36.0 | 38.362 |
| 36.0 | 38.44 |
| 36.0 | 38.504 |
| 36.0 | 38.578 |
| 36.0 | 38.601 |
| 36.0 | 38.36 |
| 36.0 | 38.423 |
| 36.0 | 38.499 |
| 36.0 | 38.568 |
| 36.0 | 38.594 |
| 36.0 | 38.364 |
| 36.0 | 38.394 |
| 36.0 | 38.488 |
| 36.0 | 38.539 |
| 36.0 | 38.571 |
| 8.0 | 38.701 |
| 8.0 | 38.731 |
| 8.0 | 38.783 |
| 8.0 | 38.739 |
| 8.0 | 38.708 |
| 8.0 | 38.73 |
| 8.0 | 38.808 |
| 8.0 | 38.859 |
| 8.0 | 38.834 |
| 8.0 | 38.819 |
| 8.0 | 38.744 |
| 8.0 | 38.825 |
| 8.0 | 38.873 |
| 8.0 | 38.887 |
| 8.0 | 38.852 |
| 8.0 | 38.74 |
| 8.0 | 38.828 |
| 8.0 | 38.907 |
| 8.0 | 38.882 |
| 8.0 | 38.893 |
| 8.0 | 38.738 |
| 8.0 | 38.83 |
| 8.0 | 38.897 |
| 8.0 | 38.905 |
| 8.0 | 38.896 |
| 8.0 | 38.711 |
| 8.0 | 38.833 |
| 8.0 | 38.898 |
| 8.0 | 38.912 |
| 8.0 | 38.906 |
| 8.0 | 38.705 |
| 8.0 | 38.833 |
| 8.0 | 38.892 |
| 8.0 | 38.898 |
| 8.0 | 38.911 |
| 8.0 | 38.728 |
| 8.0 | 38.823 |
| 8.0 | 38.897 |
| 8.0 | 38.901 |
| 8.0 | 38.904 |
| 12.0 | 38.567 |
| 12.0 | 38.634 |
| 12.0 | 38.699 |
| 12.0 | 38.693 |
| 12.0 | 38.691 |
| 12.0 | 38.576 |
| 12.0 | 38.708 |
| 12.0 | 38.768 |
| 12.0 | 38.786 |
| 12.0 | 38.796 |
| 12.0 | 38.579 |
| 12.0 | 38.718 |
| 12.0 | 38.776 |
| 12.0 | 38.829 |
| 12.0 | 38.825 |
| 12.0 | 38.569 |
| 12.0 | 38.714 |
| 12.0 | 38.805 |
| 12.0 | 38.825 |
| 12.0 | 38.864 |
| 12.0 | 38.564 |
| 12.0 | 38.712 |
| 12.0 | 38.791 |
| 12.0 | 38.843 |
| 12.0 | 38.863 |
| 12.0 | 38.532 |
| 12.0 | 38.712 |
| 12.0 | 38.789 |
| 12.0 | 38.845 |
| 12.0 | 38.871 |
| 12.0 | 38.525 |
| 12.0 | 38.711 |
| 12.0 | 38.779 |
| 12.0 | 38.829 |
| 12.0 | 38.873 |
| 12.0 | 38.549 |
| 12.0 | 38.698 |
| 12.0 | 38.783 |
| 12.0 | 38.83 |
| 12.0 | 38.865 |
| 16.0 | 38.536 |
| 16.0 | 38.54 |
| 16.0 | 38.615 |
| 16.0 | 38.626 |
| 16.0 | 38.626 |
| 16.0 | 38.52 |
| 16.0 | 38.594 |
| 16.0 | 38.679 |
| 16.0 | 38.712 |
| 16.0 | 38.723 |
| 16.0 | 38.51 |
| 16.0 | 38.594 |
| 16.0 | 38.68 |
| 16.0 | 38.752 |
| 16.0 | 38.757 |
| 16.0 | 38.491 |
| 16.0 | 38.582 |
| 16.0 | 38.703 |
| 16.0 | 38.745 |
| 16.0 | 38.793 |
| 16.0 | 38.483 |
| 16.0 | 38.576 |
| 16.0 | 38.685 |
| 16.0 | 38.759 |
| 16.0 | 38.789 |
| 16.0 | 38.449 |
| 16.0 | 38.572 |
| 16.0 | 38.678 |
| 16.0 | 38.759 |
| 16.0 | 38.794 |
| 16.0 | 38.441 |
| 16.0 | 38.568 |
| 16.0 | 38.666 |
| 16.0 | 38.739 |
| 16.0 | 38.795 |
| 16.0 | 38.464 |
| 16.0 | 38.553 |
| 16.0 | 38.668 |
| 16.0 | 38.739 |
| 16.0 | 38.785 |
| 20.0 | 38.496 |
| 20.0 | 38.537 |
| 20.0 | 38.564 |
| 20.0 | 38.562 |
| 20.0 | 38.574 |
| 20.0 | 38.467 |
| 20.0 | 38.57 |
| 20.0 | 38.61 |
| 20.0 | 38.636 |
| 20.0 | 38.667 |
| 20.0 | 38.44 |
| 20.0 | 38.559 |
| 20.0 | 38.604 |
| 20.0 | 38.676 |
| 20.0 | 38.698 |
| 20.0 | 38.415 |
| 20.0 | 38.539 |
| 20.0 | 38.619 |
| 20.0 | 38.664 |
| 20.0 | 38.732 |
| 20.0 | 38.403 |
| 20.0 | 38.53 |
| 20.0 | 38.598 |
| 20.0 | 38.676 |
| 20.0 | 38.725 |
| 20.0 | 38.369 |
| 20.0 | 38.523 |
| 20.0 | 38.587 |
| 20.0 | 38.673 |
| 20.0 | 38.729 |
| 20.0 | 38.359 |
| 20.0 | 38.517 |
| 20.0 | 38.574 |
| 20.0 | 38.65 |
| 20.0 | 38.728 |
| 20.0 | 38.38 |
| 20.0 | 38.498 |
| 20.0 | 38.573 |
| 20.0 | 38.648 |
| 20.0 | 38.716 |
| 24.0 | 38.5 |
| 24.0 | 38.513 |
| 24.0 | 38.545 |
| 24.0 | 38.526 |
| 24.0 | 38.534 |
| 24.0 | 38.467 |
| 24.0 | 38.536 |
| 24.0 | 38.578 |
| 24.0 | 38.587 |
| 24.0 | 38.615 |
| 24.0 | 38.433 |
| 24.0 | 38.514 |
| 24.0 | 38.56 |
| 24.0 | 38.619 |
| 24.0 | 38.641 |
| 24.0 | 38.401 |
| 24.0 | 38.488 |
| 24.0 | 38.571 |
| 24.0 | 38.603 |
| 24.0 | 38.671 |
| 24.0 | 38.374 |
| 24.0 | 38.474 |
| 24.0 | 38.547 |
| 24.0 | 38.613 |
| 24.0 | 38.662 |
| 24.0 | 38.336 |
| 24.0 | 38.464 |
| 24.0 | 38.535 |
| 24.0 | 38.608 |
| 24.0 | 38.663 |
| 24.0 | 38.325 |
| 24.0 | 38.456 |
| 24.0 | 38.52 |
| 24.0 | 38.583 |
| 24.0 | 38.661 |
| 24.0 | 38.345 |
| 24.0 | 38.435 |
| 24.0 | 38.515 |
| 24.0 | 38.576 |
| 24.0 | 38.648 |
| 28.0 | 38.493 |
| 28.0 | 38.491 |
| 28.0 | 38.539 |
| 28.0 | 38.506 |
| 28.0 | 38.502 |
| 28.0 | 38.457 |
| 28.0 | 38.509 |
| 28.0 | 38.565 |
| 28.0 | 38.556 |
| 28.0 | 38.575 |
| 28.0 | 38.419 |
| 28.0 | 38.481 |
| 28.0 | 38.54 |
| 28.0 | 38.578 |
| 28.0 | 38.591 |
| 28.0 | 38.385 |
| 28.0 | 38.446 |
| 28.0 | 38.544 |
| 28.0 | 38.556 |
| 28.0 | 38.618 |
| 28.0 | 38.354 |
| 28.0 | 38.428 |
| 28.0 | 38.515 |
| 28.0 | 38.564 |
| 28.0 | 38.606 |
| 28.0 | 38.325 |
| 28.0 | 38.414 |
| 28.0 | 38.501 |
| 28.0 | 38.554 |
| 28.0 | 38.601 |
| 28.0 | 38.314 |
| 28.0 | 38.404 |
| 28.0 | 38.483 |
| 28.0 | 38.527 |
| 28.0 | 38.597 |
| 28.0 | 38.335 |
| 28.0 | 38.382 |
| 28.0 | 38.477 |
| 28.0 | 38.518 |
| 28.0 | 38.579 |
| 32.0 | 38.489 |
| 32.0 | 38.473 |
| 32.0 | 38.516 |
| 32.0 | 38.501 |
| 32.0 | 38.474 |
| 32.0 | 38.452 |
| 32.0 | 38.488 |
| 32.0 | 38.539 |
| 32.0 | 38.546 |
| 32.0 | 38.537 |
| 32.0 | 38.416 |
| 32.0 | 38.455 |
| 32.0 | 38.509 |
| 32.0 | 38.562 |
| 32.0 | 38.549 |
| 32.0 | 38.381 |
| 32.0 | 38.416 |
| 32.0 | 38.508 |
| 32.0 | 38.534 |
| 32.0 | 38.569 |
| 32.0 | 38.348 |
| 32.0 | 38.393 |
| 32.0 | 38.476 |
| 32.0 | 38.538 |
| 32.0 | 38.554 |
| 32.0 | 38.318 |
| 32.0 | 38.376 |
| 32.0 | 38.457 |
| 32.0 | 38.525 |
| 32.0 | 38.547 |
| 32.0 | 38.302 |
| 32.0 | 38.365 |
| 32.0 | 38.441 |
| 32.0 | 38.495 |
| 32.0 | 38.544 |
| 32.0 | 38.323 |
| 32.0 | 38.342 |
| 32.0 | 38.433 |
| 32.0 | 38.485 |
| 32.0 | 38.524 |
| 36.0 | 38.509 |
| 36.0 | 38.476 |
| 36.0 | 38.506 |
| 36.0 | 38.493 |
| 36.0 | 38.471 |
| 36.0 | 38.473 |
| 36.0 | 38.49 |
| 36.0 | 38.524 |
| 36.0 | 38.537 |
| 36.0 | 38.532 |
| 36.0 | 38.434 |
| 36.0 | 38.456 |
| 36.0 | 38.492 |
| 36.0 | 38.55 |
| 36.0 | 38.537 |
| 36.0 | 38.397 |
| 36.0 | 38.413 |
| 36.0 | 38.487 |
| 36.0 | 38.518 |
| 36.0 | 38.553 |
| 36.0 | 38.362 |
| 36.0 | 38.387 |
| 36.0 | 38.446 |
| 36.0 | 38.514 |
| 36.0 | 38.533 |
| 36.0 | 38.332 |
| 36.0 | 38.367 |
| 36.0 | 38.424 |
| 36.0 | 38.498 |
| 36.0 | 38.522 |
| 36.0 | 38.315 |
| 36.0 | 38.355 |
| 36.0 | 38.404 |
| 36.0 | 38.468 |
| 36.0 | 38.517 |
| 36.0 | 38.32 |
| 36.0 | 38.33 |
| 36.0 | 38.397 |
| 36.0 | 38.456 |
| 36.0 | 38.495 |